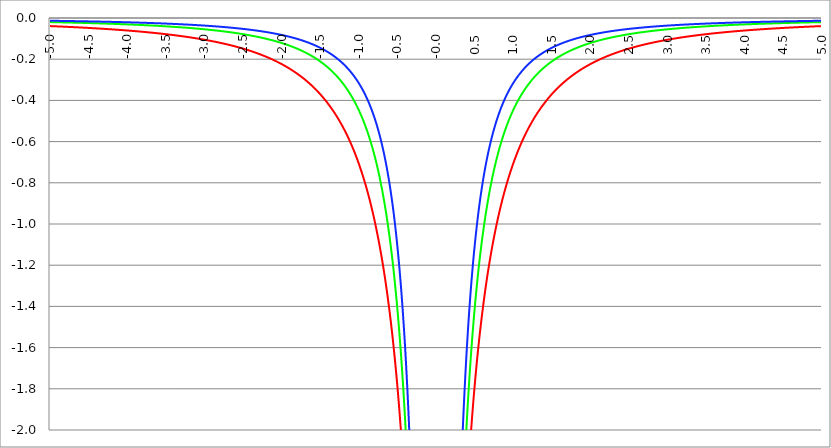
| Category | Series 1 | Series 0 | Series 2 |
|---|---|---|---|
| -5.0 | -0.039 | -0.02 | -0.013 |
| -4.995 | -0.039 | -0.02 | -0.013 |
| -4.99 | -0.039 | -0.02 | -0.013 |
| -4.985 | -0.039 | -0.02 | -0.013 |
| -4.98 | -0.04 | -0.02 | -0.013 |
| -4.975 | -0.04 | -0.02 | -0.013 |
| -4.97 | -0.04 | -0.02 | -0.013 |
| -4.965000000000001 | -0.04 | -0.02 | -0.013 |
| -4.960000000000001 | -0.04 | -0.02 | -0.014 |
| -4.955000000000001 | -0.04 | -0.02 | -0.014 |
| -4.950000000000001 | -0.04 | -0.02 | -0.014 |
| -4.945000000000001 | -0.04 | -0.02 | -0.014 |
| -4.940000000000001 | -0.04 | -0.02 | -0.014 |
| -4.935000000000001 | -0.04 | -0.02 | -0.014 |
| -4.930000000000001 | -0.04 | -0.02 | -0.014 |
| -4.925000000000002 | -0.04 | -0.021 | -0.014 |
| -4.920000000000002 | -0.04 | -0.021 | -0.014 |
| -4.915000000000002 | -0.041 | -0.021 | -0.014 |
| -4.910000000000002 | -0.041 | -0.021 | -0.014 |
| -4.905000000000002 | -0.041 | -0.021 | -0.014 |
| -4.900000000000002 | -0.041 | -0.021 | -0.014 |
| -4.895000000000002 | -0.041 | -0.021 | -0.014 |
| -4.890000000000002 | -0.041 | -0.021 | -0.014 |
| -4.885000000000002 | -0.041 | -0.021 | -0.014 |
| -4.880000000000002 | -0.041 | -0.021 | -0.014 |
| -4.875000000000003 | -0.041 | -0.021 | -0.014 |
| -4.870000000000003 | -0.041 | -0.021 | -0.014 |
| -4.865000000000003 | -0.041 | -0.021 | -0.014 |
| -4.860000000000003 | -0.041 | -0.021 | -0.014 |
| -4.855000000000003 | -0.042 | -0.021 | -0.014 |
| -4.850000000000003 | -0.042 | -0.021 | -0.014 |
| -4.845000000000003 | -0.042 | -0.021 | -0.014 |
| -4.840000000000003 | -0.042 | -0.021 | -0.014 |
| -4.835000000000003 | -0.042 | -0.021 | -0.014 |
| -4.830000000000004 | -0.042 | -0.021 | -0.014 |
| -4.825000000000004 | -0.042 | -0.021 | -0.014 |
| -4.820000000000004 | -0.042 | -0.021 | -0.014 |
| -4.815000000000004 | -0.042 | -0.021 | -0.014 |
| -4.810000000000004 | -0.042 | -0.021 | -0.014 |
| -4.805000000000004 | -0.042 | -0.022 | -0.014 |
| -4.800000000000004 | -0.042 | -0.022 | -0.014 |
| -4.795000000000004 | -0.043 | -0.022 | -0.014 |
| -4.790000000000004 | -0.043 | -0.022 | -0.014 |
| -4.785000000000004 | -0.043 | -0.022 | -0.015 |
| -4.780000000000004 | -0.043 | -0.022 | -0.015 |
| -4.775000000000004 | -0.043 | -0.022 | -0.015 |
| -4.770000000000004 | -0.043 | -0.022 | -0.015 |
| -4.765000000000005 | -0.043 | -0.022 | -0.015 |
| -4.760000000000005 | -0.043 | -0.022 | -0.015 |
| -4.755000000000005 | -0.043 | -0.022 | -0.015 |
| -4.750000000000005 | -0.043 | -0.022 | -0.015 |
| -4.745000000000005 | -0.043 | -0.022 | -0.015 |
| -4.740000000000005 | -0.044 | -0.022 | -0.015 |
| -4.735000000000005 | -0.044 | -0.022 | -0.015 |
| -4.730000000000005 | -0.044 | -0.022 | -0.015 |
| -4.725000000000006 | -0.044 | -0.022 | -0.015 |
| -4.720000000000006 | -0.044 | -0.022 | -0.015 |
| -4.715000000000006 | -0.044 | -0.022 | -0.015 |
| -4.710000000000006 | -0.044 | -0.022 | -0.015 |
| -4.705000000000006 | -0.044 | -0.022 | -0.015 |
| -4.700000000000006 | -0.044 | -0.023 | -0.015 |
| -4.695000000000006 | -0.044 | -0.023 | -0.015 |
| -4.690000000000006 | -0.044 | -0.023 | -0.015 |
| -4.685000000000007 | -0.045 | -0.023 | -0.015 |
| -4.680000000000007 | -0.045 | -0.023 | -0.015 |
| -4.675000000000007 | -0.045 | -0.023 | -0.015 |
| -4.670000000000007 | -0.045 | -0.023 | -0.015 |
| -4.665000000000007 | -0.045 | -0.023 | -0.015 |
| -4.660000000000007 | -0.045 | -0.023 | -0.015 |
| -4.655000000000007 | -0.045 | -0.023 | -0.015 |
| -4.650000000000007 | -0.045 | -0.023 | -0.015 |
| -4.645000000000007 | -0.045 | -0.023 | -0.015 |
| -4.640000000000008 | -0.045 | -0.023 | -0.015 |
| -4.635000000000008 | -0.046 | -0.023 | -0.015 |
| -4.630000000000008 | -0.046 | -0.023 | -0.016 |
| -4.625000000000008 | -0.046 | -0.023 | -0.016 |
| -4.620000000000008 | -0.046 | -0.023 | -0.016 |
| -4.615000000000008 | -0.046 | -0.023 | -0.016 |
| -4.610000000000008 | -0.046 | -0.023 | -0.016 |
| -4.605000000000008 | -0.046 | -0.023 | -0.016 |
| -4.600000000000008 | -0.046 | -0.023 | -0.016 |
| -4.595000000000009 | -0.046 | -0.024 | -0.016 |
| -4.590000000000009 | -0.046 | -0.024 | -0.016 |
| -4.585000000000009 | -0.046 | -0.024 | -0.016 |
| -4.580000000000009 | -0.047 | -0.024 | -0.016 |
| -4.57500000000001 | -0.047 | -0.024 | -0.016 |
| -4.57000000000001 | -0.047 | -0.024 | -0.016 |
| -4.565000000000009 | -0.047 | -0.024 | -0.016 |
| -4.560000000000009 | -0.047 | -0.024 | -0.016 |
| -4.555000000000009 | -0.047 | -0.024 | -0.016 |
| -4.55000000000001 | -0.047 | -0.024 | -0.016 |
| -4.54500000000001 | -0.047 | -0.024 | -0.016 |
| -4.54000000000001 | -0.047 | -0.024 | -0.016 |
| -4.53500000000001 | -0.047 | -0.024 | -0.016 |
| -4.53000000000001 | -0.048 | -0.024 | -0.016 |
| -4.52500000000001 | -0.048 | -0.024 | -0.016 |
| -4.52000000000001 | -0.048 | -0.024 | -0.016 |
| -4.51500000000001 | -0.048 | -0.024 | -0.016 |
| -4.51000000000001 | -0.048 | -0.024 | -0.016 |
| -4.505000000000011 | -0.048 | -0.024 | -0.016 |
| -4.500000000000011 | -0.048 | -0.025 | -0.016 |
| -4.495000000000011 | -0.048 | -0.025 | -0.016 |
| -4.490000000000011 | -0.048 | -0.025 | -0.016 |
| -4.485000000000011 | -0.049 | -0.025 | -0.017 |
| -4.480000000000011 | -0.049 | -0.025 | -0.017 |
| -4.475000000000011 | -0.049 | -0.025 | -0.017 |
| -4.470000000000011 | -0.049 | -0.025 | -0.017 |
| -4.465000000000011 | -0.049 | -0.025 | -0.017 |
| -4.460000000000011 | -0.049 | -0.025 | -0.017 |
| -4.455000000000012 | -0.049 | -0.025 | -0.017 |
| -4.450000000000012 | -0.049 | -0.025 | -0.017 |
| -4.445000000000012 | -0.049 | -0.025 | -0.017 |
| -4.440000000000012 | -0.049 | -0.025 | -0.017 |
| -4.435000000000012 | -0.05 | -0.025 | -0.017 |
| -4.430000000000012 | -0.05 | -0.025 | -0.017 |
| -4.425000000000012 | -0.05 | -0.025 | -0.017 |
| -4.420000000000012 | -0.05 | -0.025 | -0.017 |
| -4.415000000000012 | -0.05 | -0.025 | -0.017 |
| -4.410000000000013 | -0.05 | -0.026 | -0.017 |
| -4.405000000000013 | -0.05 | -0.026 | -0.017 |
| -4.400000000000013 | -0.05 | -0.026 | -0.017 |
| -4.395000000000013 | -0.05 | -0.026 | -0.017 |
| -4.390000000000013 | -0.051 | -0.026 | -0.017 |
| -4.385000000000013 | -0.051 | -0.026 | -0.017 |
| -4.380000000000013 | -0.051 | -0.026 | -0.017 |
| -4.375000000000013 | -0.051 | -0.026 | -0.017 |
| -4.370000000000013 | -0.051 | -0.026 | -0.017 |
| -4.365000000000013 | -0.051 | -0.026 | -0.017 |
| -4.360000000000014 | -0.051 | -0.026 | -0.017 |
| -4.355000000000014 | -0.051 | -0.026 | -0.018 |
| -4.350000000000014 | -0.052 | -0.026 | -0.018 |
| -4.345000000000014 | -0.052 | -0.026 | -0.018 |
| -4.340000000000014 | -0.052 | -0.026 | -0.018 |
| -4.335000000000014 | -0.052 | -0.026 | -0.018 |
| -4.330000000000014 | -0.052 | -0.026 | -0.018 |
| -4.325000000000014 | -0.052 | -0.027 | -0.018 |
| -4.320000000000014 | -0.052 | -0.027 | -0.018 |
| -4.315000000000015 | -0.052 | -0.027 | -0.018 |
| -4.310000000000015 | -0.052 | -0.027 | -0.018 |
| -4.305000000000015 | -0.053 | -0.027 | -0.018 |
| -4.300000000000015 | -0.053 | -0.027 | -0.018 |
| -4.295000000000015 | -0.053 | -0.027 | -0.018 |
| -4.290000000000015 | -0.053 | -0.027 | -0.018 |
| -4.285000000000015 | -0.053 | -0.027 | -0.018 |
| -4.280000000000015 | -0.053 | -0.027 | -0.018 |
| -4.275000000000015 | -0.053 | -0.027 | -0.018 |
| -4.270000000000015 | -0.053 | -0.027 | -0.018 |
| -4.265000000000016 | -0.054 | -0.027 | -0.018 |
| -4.260000000000016 | -0.054 | -0.027 | -0.018 |
| -4.255000000000016 | -0.054 | -0.027 | -0.018 |
| -4.250000000000016 | -0.054 | -0.027 | -0.018 |
| -4.245000000000016 | -0.054 | -0.028 | -0.018 |
| -4.240000000000016 | -0.054 | -0.028 | -0.018 |
| -4.235000000000016 | -0.054 | -0.028 | -0.019 |
| -4.230000000000016 | -0.054 | -0.028 | -0.019 |
| -4.225000000000017 | -0.055 | -0.028 | -0.019 |
| -4.220000000000017 | -0.055 | -0.028 | -0.019 |
| -4.215000000000017 | -0.055 | -0.028 | -0.019 |
| -4.210000000000017 | -0.055 | -0.028 | -0.019 |
| -4.205000000000017 | -0.055 | -0.028 | -0.019 |
| -4.200000000000017 | -0.055 | -0.028 | -0.019 |
| -4.195000000000017 | -0.055 | -0.028 | -0.019 |
| -4.190000000000017 | -0.055 | -0.028 | -0.019 |
| -4.185000000000017 | -0.056 | -0.028 | -0.019 |
| -4.180000000000017 | -0.056 | -0.028 | -0.019 |
| -4.175000000000018 | -0.056 | -0.028 | -0.019 |
| -4.170000000000018 | -0.056 | -0.029 | -0.019 |
| -4.165000000000018 | -0.056 | -0.029 | -0.019 |
| -4.160000000000018 | -0.056 | -0.029 | -0.019 |
| -4.155000000000018 | -0.056 | -0.029 | -0.019 |
| -4.150000000000018 | -0.056 | -0.029 | -0.019 |
| -4.145000000000018 | -0.057 | -0.029 | -0.019 |
| -4.140000000000018 | -0.057 | -0.029 | -0.019 |
| -4.135000000000018 | -0.057 | -0.029 | -0.019 |
| -4.130000000000019 | -0.057 | -0.029 | -0.019 |
| -4.125000000000019 | -0.057 | -0.029 | -0.02 |
| -4.120000000000019 | -0.057 | -0.029 | -0.02 |
| -4.115000000000019 | -0.057 | -0.029 | -0.02 |
| -4.110000000000019 | -0.058 | -0.029 | -0.02 |
| -4.105000000000019 | -0.058 | -0.029 | -0.02 |
| -4.100000000000019 | -0.058 | -0.03 | -0.02 |
| -4.095000000000019 | -0.058 | -0.03 | -0.02 |
| -4.090000000000019 | -0.058 | -0.03 | -0.02 |
| -4.085000000000019 | -0.058 | -0.03 | -0.02 |
| -4.08000000000002 | -0.058 | -0.03 | -0.02 |
| -4.07500000000002 | -0.058 | -0.03 | -0.02 |
| -4.07000000000002 | -0.059 | -0.03 | -0.02 |
| -4.06500000000002 | -0.059 | -0.03 | -0.02 |
| -4.06000000000002 | -0.059 | -0.03 | -0.02 |
| -4.05500000000002 | -0.059 | -0.03 | -0.02 |
| -4.05000000000002 | -0.059 | -0.03 | -0.02 |
| -4.04500000000002 | -0.059 | -0.03 | -0.02 |
| -4.04000000000002 | -0.059 | -0.03 | -0.02 |
| -4.03500000000002 | -0.06 | -0.03 | -0.02 |
| -4.03000000000002 | -0.06 | -0.031 | -0.02 |
| -4.025000000000021 | -0.06 | -0.031 | -0.021 |
| -4.020000000000021 | -0.06 | -0.031 | -0.021 |
| -4.015000000000021 | -0.06 | -0.031 | -0.021 |
| -4.010000000000021 | -0.06 | -0.031 | -0.021 |
| -4.005000000000021 | -0.06 | -0.031 | -0.021 |
| -4.000000000000021 | -0.061 | -0.031 | -0.021 |
| -3.995000000000021 | -0.061 | -0.031 | -0.021 |
| -3.990000000000021 | -0.061 | -0.031 | -0.021 |
| -3.985000000000022 | -0.061 | -0.031 | -0.021 |
| -3.980000000000022 | -0.061 | -0.031 | -0.021 |
| -3.975000000000022 | -0.061 | -0.031 | -0.021 |
| -3.970000000000022 | -0.062 | -0.031 | -0.021 |
| -3.965000000000022 | -0.062 | -0.032 | -0.021 |
| -3.960000000000022 | -0.062 | -0.032 | -0.021 |
| -3.955000000000022 | -0.062 | -0.032 | -0.021 |
| -3.950000000000022 | -0.062 | -0.032 | -0.021 |
| -3.945000000000022 | -0.062 | -0.032 | -0.021 |
| -3.940000000000023 | -0.062 | -0.032 | -0.021 |
| -3.935000000000023 | -0.063 | -0.032 | -0.021 |
| -3.930000000000023 | -0.063 | -0.032 | -0.022 |
| -3.925000000000023 | -0.063 | -0.032 | -0.022 |
| -3.920000000000023 | -0.063 | -0.032 | -0.022 |
| -3.915000000000023 | -0.063 | -0.032 | -0.022 |
| -3.910000000000023 | -0.063 | -0.032 | -0.022 |
| -3.905000000000023 | -0.064 | -0.033 | -0.022 |
| -3.900000000000023 | -0.064 | -0.033 | -0.022 |
| -3.895000000000023 | -0.064 | -0.033 | -0.022 |
| -3.890000000000024 | -0.064 | -0.033 | -0.022 |
| -3.885000000000024 | -0.064 | -0.033 | -0.022 |
| -3.880000000000024 | -0.064 | -0.033 | -0.022 |
| -3.875000000000024 | -0.064 | -0.033 | -0.022 |
| -3.870000000000024 | -0.065 | -0.033 | -0.022 |
| -3.865000000000024 | -0.065 | -0.033 | -0.022 |
| -3.860000000000024 | -0.065 | -0.033 | -0.022 |
| -3.855000000000024 | -0.065 | -0.033 | -0.022 |
| -3.850000000000024 | -0.065 | -0.033 | -0.022 |
| -3.845000000000025 | -0.065 | -0.034 | -0.022 |
| -3.840000000000025 | -0.066 | -0.034 | -0.023 |
| -3.835000000000025 | -0.066 | -0.034 | -0.023 |
| -3.830000000000025 | -0.066 | -0.034 | -0.023 |
| -3.825000000000025 | -0.066 | -0.034 | -0.023 |
| -3.820000000000025 | -0.066 | -0.034 | -0.023 |
| -3.815000000000025 | -0.066 | -0.034 | -0.023 |
| -3.810000000000025 | -0.067 | -0.034 | -0.023 |
| -3.805000000000025 | -0.067 | -0.034 | -0.023 |
| -3.800000000000026 | -0.067 | -0.034 | -0.023 |
| -3.795000000000026 | -0.067 | -0.034 | -0.023 |
| -3.790000000000026 | -0.067 | -0.035 | -0.023 |
| -3.785000000000026 | -0.067 | -0.035 | -0.023 |
| -3.780000000000026 | -0.068 | -0.035 | -0.023 |
| -3.775000000000026 | -0.068 | -0.035 | -0.023 |
| -3.770000000000026 | -0.068 | -0.035 | -0.023 |
| -3.765000000000026 | -0.068 | -0.035 | -0.023 |
| -3.760000000000026 | -0.068 | -0.035 | -0.023 |
| -3.755000000000026 | -0.069 | -0.035 | -0.024 |
| -3.750000000000027 | -0.069 | -0.035 | -0.024 |
| -3.745000000000027 | -0.069 | -0.035 | -0.024 |
| -3.740000000000027 | -0.069 | -0.035 | -0.024 |
| -3.735000000000027 | -0.069 | -0.036 | -0.024 |
| -3.730000000000027 | -0.069 | -0.036 | -0.024 |
| -3.725000000000027 | -0.07 | -0.036 | -0.024 |
| -3.720000000000027 | -0.07 | -0.036 | -0.024 |
| -3.715000000000027 | -0.07 | -0.036 | -0.024 |
| -3.710000000000027 | -0.07 | -0.036 | -0.024 |
| -3.705000000000028 | -0.07 | -0.036 | -0.024 |
| -3.700000000000028 | -0.071 | -0.036 | -0.024 |
| -3.695000000000028 | -0.071 | -0.036 | -0.024 |
| -3.690000000000028 | -0.071 | -0.036 | -0.024 |
| -3.685000000000028 | -0.071 | -0.036 | -0.024 |
| -3.680000000000028 | -0.071 | -0.037 | -0.025 |
| -3.675000000000028 | -0.071 | -0.037 | -0.025 |
| -3.670000000000028 | -0.072 | -0.037 | -0.025 |
| -3.665000000000028 | -0.072 | -0.037 | -0.025 |
| -3.660000000000028 | -0.072 | -0.037 | -0.025 |
| -3.655000000000029 | -0.072 | -0.037 | -0.025 |
| -3.650000000000029 | -0.072 | -0.037 | -0.025 |
| -3.645000000000029 | -0.073 | -0.037 | -0.025 |
| -3.640000000000029 | -0.073 | -0.037 | -0.025 |
| -3.635000000000029 | -0.073 | -0.037 | -0.025 |
| -3.630000000000029 | -0.073 | -0.038 | -0.025 |
| -3.625000000000029 | -0.073 | -0.038 | -0.025 |
| -3.620000000000029 | -0.074 | -0.038 | -0.025 |
| -3.615000000000029 | -0.074 | -0.038 | -0.025 |
| -3.61000000000003 | -0.074 | -0.038 | -0.025 |
| -3.60500000000003 | -0.074 | -0.038 | -0.026 |
| -3.60000000000003 | -0.074 | -0.038 | -0.026 |
| -3.59500000000003 | -0.075 | -0.038 | -0.026 |
| -3.59000000000003 | -0.075 | -0.038 | -0.026 |
| -3.58500000000003 | -0.075 | -0.039 | -0.026 |
| -3.58000000000003 | -0.075 | -0.039 | -0.026 |
| -3.57500000000003 | -0.075 | -0.039 | -0.026 |
| -3.57000000000003 | -0.076 | -0.039 | -0.026 |
| -3.565000000000031 | -0.076 | -0.039 | -0.026 |
| -3.560000000000031 | -0.076 | -0.039 | -0.026 |
| -3.555000000000031 | -0.076 | -0.039 | -0.026 |
| -3.550000000000031 | -0.076 | -0.039 | -0.026 |
| -3.545000000000031 | -0.077 | -0.039 | -0.026 |
| -3.540000000000031 | -0.077 | -0.04 | -0.026 |
| -3.535000000000031 | -0.077 | -0.04 | -0.027 |
| -3.530000000000031 | -0.077 | -0.04 | -0.027 |
| -3.525000000000031 | -0.077 | -0.04 | -0.027 |
| -3.520000000000032 | -0.078 | -0.04 | -0.027 |
| -3.515000000000032 | -0.078 | -0.04 | -0.027 |
| -3.510000000000032 | -0.078 | -0.04 | -0.027 |
| -3.505000000000032 | -0.078 | -0.04 | -0.027 |
| -3.500000000000032 | -0.078 | -0.04 | -0.027 |
| -3.495000000000032 | -0.079 | -0.041 | -0.027 |
| -3.490000000000032 | -0.079 | -0.041 | -0.027 |
| -3.485000000000032 | -0.079 | -0.041 | -0.027 |
| -3.480000000000032 | -0.079 | -0.041 | -0.027 |
| -3.475000000000032 | -0.08 | -0.041 | -0.027 |
| -3.470000000000033 | -0.08 | -0.041 | -0.028 |
| -3.465000000000033 | -0.08 | -0.041 | -0.028 |
| -3.460000000000033 | -0.08 | -0.041 | -0.028 |
| -3.455000000000033 | -0.08 | -0.041 | -0.028 |
| -3.450000000000033 | -0.081 | -0.042 | -0.028 |
| -3.445000000000033 | -0.081 | -0.042 | -0.028 |
| -3.440000000000033 | -0.081 | -0.042 | -0.028 |
| -3.435000000000033 | -0.081 | -0.042 | -0.028 |
| -3.430000000000033 | -0.082 | -0.042 | -0.028 |
| -3.425000000000034 | -0.082 | -0.042 | -0.028 |
| -3.420000000000034 | -0.082 | -0.042 | -0.028 |
| -3.415000000000034 | -0.082 | -0.042 | -0.028 |
| -3.410000000000034 | -0.083 | -0.043 | -0.029 |
| -3.405000000000034 | -0.083 | -0.043 | -0.029 |
| -3.400000000000034 | -0.083 | -0.043 | -0.029 |
| -3.395000000000034 | -0.083 | -0.043 | -0.029 |
| -3.390000000000034 | -0.083 | -0.043 | -0.029 |
| -3.385000000000034 | -0.084 | -0.043 | -0.029 |
| -3.380000000000034 | -0.084 | -0.043 | -0.029 |
| -3.375000000000035 | -0.084 | -0.043 | -0.029 |
| -3.370000000000035 | -0.084 | -0.044 | -0.029 |
| -3.365000000000035 | -0.085 | -0.044 | -0.029 |
| -3.360000000000035 | -0.085 | -0.044 | -0.029 |
| -3.355000000000035 | -0.085 | -0.044 | -0.029 |
| -3.350000000000035 | -0.085 | -0.044 | -0.03 |
| -3.345000000000035 | -0.086 | -0.044 | -0.03 |
| -3.340000000000035 | -0.086 | -0.044 | -0.03 |
| -3.335000000000035 | -0.086 | -0.044 | -0.03 |
| -3.330000000000036 | -0.086 | -0.045 | -0.03 |
| -3.325000000000036 | -0.087 | -0.045 | -0.03 |
| -3.320000000000036 | -0.087 | -0.045 | -0.03 |
| -3.315000000000036 | -0.087 | -0.045 | -0.03 |
| -3.310000000000036 | -0.087 | -0.045 | -0.03 |
| -3.305000000000036 | -0.088 | -0.045 | -0.03 |
| -3.300000000000036 | -0.088 | -0.045 | -0.03 |
| -3.295000000000036 | -0.088 | -0.046 | -0.031 |
| -3.290000000000036 | -0.088 | -0.046 | -0.031 |
| -3.285000000000036 | -0.089 | -0.046 | -0.031 |
| -3.280000000000036 | -0.089 | -0.046 | -0.031 |
| -3.275000000000037 | -0.089 | -0.046 | -0.031 |
| -3.270000000000037 | -0.089 | -0.046 | -0.031 |
| -3.265000000000037 | -0.09 | -0.046 | -0.031 |
| -3.260000000000037 | -0.09 | -0.047 | -0.031 |
| -3.255000000000037 | -0.09 | -0.047 | -0.031 |
| -3.250000000000037 | -0.09 | -0.047 | -0.031 |
| -3.245000000000037 | -0.091 | -0.047 | -0.031 |
| -3.240000000000037 | -0.091 | -0.047 | -0.032 |
| -3.235000000000038 | -0.091 | -0.047 | -0.032 |
| -3.230000000000038 | -0.092 | -0.047 | -0.032 |
| -3.225000000000038 | -0.092 | -0.048 | -0.032 |
| -3.220000000000038 | -0.092 | -0.048 | -0.032 |
| -3.215000000000038 | -0.092 | -0.048 | -0.032 |
| -3.210000000000038 | -0.093 | -0.048 | -0.032 |
| -3.205000000000038 | -0.093 | -0.048 | -0.032 |
| -3.200000000000038 | -0.093 | -0.048 | -0.032 |
| -3.195000000000038 | -0.093 | -0.048 | -0.032 |
| -3.190000000000039 | -0.094 | -0.049 | -0.033 |
| -3.185000000000039 | -0.094 | -0.049 | -0.033 |
| -3.180000000000039 | -0.094 | -0.049 | -0.033 |
| -3.175000000000039 | -0.095 | -0.049 | -0.033 |
| -3.170000000000039 | -0.095 | -0.049 | -0.033 |
| -3.16500000000004 | -0.095 | -0.049 | -0.033 |
| -3.16000000000004 | -0.095 | -0.049 | -0.033 |
| -3.155000000000039 | -0.096 | -0.05 | -0.033 |
| -3.150000000000039 | -0.096 | -0.05 | -0.033 |
| -3.14500000000004 | -0.096 | -0.05 | -0.034 |
| -3.14000000000004 | -0.097 | -0.05 | -0.034 |
| -3.13500000000004 | -0.097 | -0.05 | -0.034 |
| -3.13000000000004 | -0.097 | -0.05 | -0.034 |
| -3.12500000000004 | -0.098 | -0.051 | -0.034 |
| -3.12000000000004 | -0.098 | -0.051 | -0.034 |
| -3.11500000000004 | -0.098 | -0.051 | -0.034 |
| -3.11000000000004 | -0.098 | -0.051 | -0.034 |
| -3.10500000000004 | -0.099 | -0.051 | -0.034 |
| -3.10000000000004 | -0.099 | -0.051 | -0.034 |
| -3.095000000000041 | -0.099 | -0.052 | -0.035 |
| -3.090000000000041 | -0.1 | -0.052 | -0.035 |
| -3.085000000000041 | -0.1 | -0.052 | -0.035 |
| -3.080000000000041 | -0.1 | -0.052 | -0.035 |
| -3.075000000000041 | -0.101 | -0.052 | -0.035 |
| -3.070000000000041 | -0.101 | -0.052 | -0.035 |
| -3.065000000000041 | -0.101 | -0.053 | -0.035 |
| -3.060000000000041 | -0.102 | -0.053 | -0.035 |
| -3.055000000000041 | -0.102 | -0.053 | -0.036 |
| -3.050000000000042 | -0.102 | -0.053 | -0.036 |
| -3.045000000000042 | -0.102 | -0.053 | -0.036 |
| -3.040000000000042 | -0.103 | -0.053 | -0.036 |
| -3.035000000000042 | -0.103 | -0.054 | -0.036 |
| -3.030000000000042 | -0.103 | -0.054 | -0.036 |
| -3.025000000000042 | -0.104 | -0.054 | -0.036 |
| -3.020000000000042 | -0.104 | -0.054 | -0.036 |
| -3.015000000000042 | -0.104 | -0.054 | -0.036 |
| -3.010000000000042 | -0.105 | -0.054 | -0.037 |
| -3.005000000000043 | -0.105 | -0.055 | -0.037 |
| -3.000000000000043 | -0.105 | -0.055 | -0.037 |
| -2.995000000000043 | -0.106 | -0.055 | -0.037 |
| -2.990000000000043 | -0.106 | -0.055 | -0.037 |
| -2.985000000000043 | -0.106 | -0.055 | -0.037 |
| -2.980000000000043 | -0.107 | -0.056 | -0.037 |
| -2.975000000000043 | -0.107 | -0.056 | -0.037 |
| -2.970000000000043 | -0.107 | -0.056 | -0.038 |
| -2.965000000000043 | -0.108 | -0.056 | -0.038 |
| -2.960000000000043 | -0.108 | -0.056 | -0.038 |
| -2.955000000000044 | -0.108 | -0.056 | -0.038 |
| -2.950000000000044 | -0.109 | -0.057 | -0.038 |
| -2.945000000000044 | -0.109 | -0.057 | -0.038 |
| -2.940000000000044 | -0.11 | -0.057 | -0.038 |
| -2.935000000000044 | -0.11 | -0.057 | -0.038 |
| -2.930000000000044 | -0.11 | -0.057 | -0.039 |
| -2.925000000000044 | -0.111 | -0.058 | -0.039 |
| -2.920000000000044 | -0.111 | -0.058 | -0.039 |
| -2.915000000000044 | -0.111 | -0.058 | -0.039 |
| -2.910000000000045 | -0.112 | -0.058 | -0.039 |
| -2.905000000000045 | -0.112 | -0.058 | -0.039 |
| -2.900000000000045 | -0.112 | -0.059 | -0.039 |
| -2.895000000000045 | -0.113 | -0.059 | -0.04 |
| -2.890000000000045 | -0.113 | -0.059 | -0.04 |
| -2.885000000000045 | -0.114 | -0.059 | -0.04 |
| -2.880000000000045 | -0.114 | -0.059 | -0.04 |
| -2.875000000000045 | -0.114 | -0.06 | -0.04 |
| -2.870000000000045 | -0.115 | -0.06 | -0.04 |
| -2.865000000000045 | -0.115 | -0.06 | -0.04 |
| -2.860000000000046 | -0.115 | -0.06 | -0.04 |
| -2.855000000000046 | -0.116 | -0.06 | -0.041 |
| -2.850000000000046 | -0.116 | -0.061 | -0.041 |
| -2.845000000000046 | -0.117 | -0.061 | -0.041 |
| -2.840000000000046 | -0.117 | -0.061 | -0.041 |
| -2.835000000000046 | -0.117 | -0.061 | -0.041 |
| -2.830000000000046 | -0.118 | -0.061 | -0.041 |
| -2.825000000000046 | -0.118 | -0.062 | -0.041 |
| -2.820000000000046 | -0.119 | -0.062 | -0.042 |
| -2.815000000000047 | -0.119 | -0.062 | -0.042 |
| -2.810000000000047 | -0.119 | -0.062 | -0.042 |
| -2.805000000000047 | -0.12 | -0.063 | -0.042 |
| -2.800000000000047 | -0.12 | -0.063 | -0.042 |
| -2.795000000000047 | -0.121 | -0.063 | -0.042 |
| -2.790000000000047 | -0.121 | -0.063 | -0.043 |
| -2.785000000000047 | -0.121 | -0.063 | -0.043 |
| -2.780000000000047 | -0.122 | -0.064 | -0.043 |
| -2.775000000000047 | -0.122 | -0.064 | -0.043 |
| -2.770000000000047 | -0.123 | -0.064 | -0.043 |
| -2.765000000000048 | -0.123 | -0.064 | -0.043 |
| -2.760000000000048 | -0.123 | -0.065 | -0.043 |
| -2.755000000000048 | -0.124 | -0.065 | -0.044 |
| -2.750000000000048 | -0.124 | -0.065 | -0.044 |
| -2.745000000000048 | -0.125 | -0.065 | -0.044 |
| -2.740000000000048 | -0.125 | -0.066 | -0.044 |
| -2.735000000000048 | -0.126 | -0.066 | -0.044 |
| -2.730000000000048 | -0.126 | -0.066 | -0.044 |
| -2.725000000000048 | -0.126 | -0.066 | -0.045 |
| -2.720000000000049 | -0.127 | -0.066 | -0.045 |
| -2.715000000000049 | -0.127 | -0.067 | -0.045 |
| -2.710000000000049 | -0.128 | -0.067 | -0.045 |
| -2.705000000000049 | -0.128 | -0.067 | -0.045 |
| -2.700000000000049 | -0.129 | -0.067 | -0.045 |
| -2.695000000000049 | -0.129 | -0.068 | -0.046 |
| -2.690000000000049 | -0.13 | -0.068 | -0.046 |
| -2.685000000000049 | -0.13 | -0.068 | -0.046 |
| -2.680000000000049 | -0.13 | -0.068 | -0.046 |
| -2.675000000000049 | -0.131 | -0.069 | -0.046 |
| -2.67000000000005 | -0.131 | -0.069 | -0.046 |
| -2.66500000000005 | -0.132 | -0.069 | -0.047 |
| -2.66000000000005 | -0.132 | -0.069 | -0.047 |
| -2.65500000000005 | -0.133 | -0.07 | -0.047 |
| -2.65000000000005 | -0.133 | -0.07 | -0.047 |
| -2.64500000000005 | -0.134 | -0.07 | -0.047 |
| -2.64000000000005 | -0.134 | -0.07 | -0.047 |
| -2.63500000000005 | -0.135 | -0.071 | -0.048 |
| -2.63000000000005 | -0.135 | -0.071 | -0.048 |
| -2.625000000000051 | -0.136 | -0.071 | -0.048 |
| -2.620000000000051 | -0.136 | -0.072 | -0.048 |
| -2.615000000000051 | -0.137 | -0.072 | -0.048 |
| -2.610000000000051 | -0.137 | -0.072 | -0.049 |
| -2.605000000000051 | -0.138 | -0.072 | -0.049 |
| -2.600000000000051 | -0.138 | -0.073 | -0.049 |
| -2.595000000000051 | -0.139 | -0.073 | -0.049 |
| -2.590000000000051 | -0.139 | -0.073 | -0.049 |
| -2.585000000000051 | -0.14 | -0.073 | -0.049 |
| -2.580000000000052 | -0.14 | -0.074 | -0.05 |
| -2.575000000000052 | -0.141 | -0.074 | -0.05 |
| -2.570000000000052 | -0.141 | -0.074 | -0.05 |
| -2.565000000000052 | -0.142 | -0.075 | -0.05 |
| -2.560000000000052 | -0.142 | -0.075 | -0.05 |
| -2.555000000000052 | -0.143 | -0.075 | -0.051 |
| -2.550000000000052 | -0.143 | -0.075 | -0.051 |
| -2.545000000000052 | -0.144 | -0.076 | -0.051 |
| -2.540000000000052 | -0.144 | -0.076 | -0.051 |
| -2.535000000000053 | -0.145 | -0.076 | -0.051 |
| -2.530000000000053 | -0.145 | -0.077 | -0.052 |
| -2.525000000000053 | -0.146 | -0.077 | -0.052 |
| -2.520000000000053 | -0.146 | -0.077 | -0.052 |
| -2.515000000000053 | -0.147 | -0.078 | -0.052 |
| -2.510000000000053 | -0.147 | -0.078 | -0.052 |
| -2.505000000000053 | -0.148 | -0.078 | -0.053 |
| -2.500000000000053 | -0.149 | -0.078 | -0.053 |
| -2.495000000000053 | -0.149 | -0.079 | -0.053 |
| -2.490000000000053 | -0.15 | -0.079 | -0.053 |
| -2.485000000000054 | -0.15 | -0.079 | -0.053 |
| -2.480000000000054 | -0.151 | -0.08 | -0.054 |
| -2.475000000000054 | -0.151 | -0.08 | -0.054 |
| -2.470000000000054 | -0.152 | -0.08 | -0.054 |
| -2.465000000000054 | -0.153 | -0.081 | -0.054 |
| -2.460000000000054 | -0.153 | -0.081 | -0.055 |
| -2.455000000000054 | -0.154 | -0.081 | -0.055 |
| -2.450000000000054 | -0.154 | -0.082 | -0.055 |
| -2.445000000000054 | -0.155 | -0.082 | -0.055 |
| -2.440000000000055 | -0.155 | -0.082 | -0.055 |
| -2.435000000000055 | -0.156 | -0.083 | -0.056 |
| -2.430000000000055 | -0.157 | -0.083 | -0.056 |
| -2.425000000000055 | -0.157 | -0.083 | -0.056 |
| -2.420000000000055 | -0.158 | -0.084 | -0.056 |
| -2.415000000000055 | -0.158 | -0.084 | -0.057 |
| -2.410000000000055 | -0.159 | -0.084 | -0.057 |
| -2.405000000000055 | -0.16 | -0.085 | -0.057 |
| -2.400000000000055 | -0.16 | -0.085 | -0.057 |
| -2.395000000000055 | -0.161 | -0.085 | -0.058 |
| -2.390000000000056 | -0.162 | -0.086 | -0.058 |
| -2.385000000000056 | -0.162 | -0.086 | -0.058 |
| -2.380000000000056 | -0.163 | -0.086 | -0.058 |
| -2.375000000000056 | -0.163 | -0.087 | -0.059 |
| -2.370000000000056 | -0.164 | -0.087 | -0.059 |
| -2.365000000000056 | -0.165 | -0.087 | -0.059 |
| -2.360000000000056 | -0.165 | -0.088 | -0.059 |
| -2.355000000000056 | -0.166 | -0.088 | -0.06 |
| -2.350000000000056 | -0.167 | -0.089 | -0.06 |
| -2.345000000000057 | -0.167 | -0.089 | -0.06 |
| -2.340000000000057 | -0.168 | -0.089 | -0.06 |
| -2.335000000000057 | -0.169 | -0.09 | -0.061 |
| -2.330000000000057 | -0.169 | -0.09 | -0.061 |
| -2.325000000000057 | -0.17 | -0.09 | -0.061 |
| -2.320000000000057 | -0.171 | -0.091 | -0.061 |
| -2.315000000000057 | -0.171 | -0.091 | -0.062 |
| -2.310000000000057 | -0.172 | -0.092 | -0.062 |
| -2.305000000000057 | -0.173 | -0.092 | -0.062 |
| -2.300000000000058 | -0.173 | -0.092 | -0.062 |
| -2.295000000000058 | -0.174 | -0.093 | -0.063 |
| -2.290000000000058 | -0.175 | -0.093 | -0.063 |
| -2.285000000000058 | -0.175 | -0.094 | -0.063 |
| -2.280000000000058 | -0.176 | -0.094 | -0.063 |
| -2.275000000000058 | -0.177 | -0.094 | -0.064 |
| -2.270000000000058 | -0.178 | -0.095 | -0.064 |
| -2.265000000000058 | -0.178 | -0.095 | -0.064 |
| -2.260000000000058 | -0.179 | -0.096 | -0.065 |
| -2.255000000000058 | -0.18 | -0.096 | -0.065 |
| -2.250000000000059 | -0.181 | -0.096 | -0.065 |
| -2.245000000000059 | -0.181 | -0.097 | -0.065 |
| -2.240000000000059 | -0.182 | -0.097 | -0.066 |
| -2.235000000000059 | -0.183 | -0.098 | -0.066 |
| -2.23000000000006 | -0.183 | -0.098 | -0.066 |
| -2.22500000000006 | -0.184 | -0.099 | -0.067 |
| -2.22000000000006 | -0.185 | -0.099 | -0.067 |
| -2.215000000000059 | -0.186 | -0.099 | -0.067 |
| -2.210000000000059 | -0.187 | -0.1 | -0.067 |
| -2.20500000000006 | -0.187 | -0.1 | -0.068 |
| -2.20000000000006 | -0.188 | -0.101 | -0.068 |
| -2.19500000000006 | -0.189 | -0.101 | -0.068 |
| -2.19000000000006 | -0.19 | -0.102 | -0.069 |
| -2.18500000000006 | -0.19 | -0.102 | -0.069 |
| -2.18000000000006 | -0.191 | -0.103 | -0.069 |
| -2.17500000000006 | -0.192 | -0.103 | -0.07 |
| -2.17000000000006 | -0.193 | -0.103 | -0.07 |
| -2.16500000000006 | -0.194 | -0.104 | -0.07 |
| -2.160000000000061 | -0.195 | -0.104 | -0.071 |
| -2.155000000000061 | -0.195 | -0.105 | -0.071 |
| -2.150000000000061 | -0.196 | -0.105 | -0.071 |
| -2.145000000000061 | -0.197 | -0.106 | -0.072 |
| -2.140000000000061 | -0.198 | -0.106 | -0.072 |
| -2.135000000000061 | -0.199 | -0.107 | -0.072 |
| -2.130000000000061 | -0.2 | -0.107 | -0.073 |
| -2.125000000000061 | -0.2 | -0.108 | -0.073 |
| -2.120000000000061 | -0.201 | -0.108 | -0.073 |
| -2.115000000000061 | -0.202 | -0.109 | -0.074 |
| -2.110000000000062 | -0.203 | -0.109 | -0.074 |
| -2.105000000000062 | -0.204 | -0.11 | -0.074 |
| -2.100000000000062 | -0.205 | -0.11 | -0.075 |
| -2.095000000000062 | -0.206 | -0.111 | -0.075 |
| -2.090000000000062 | -0.207 | -0.111 | -0.075 |
| -2.085000000000062 | -0.207 | -0.112 | -0.076 |
| -2.080000000000062 | -0.208 | -0.112 | -0.076 |
| -2.075000000000062 | -0.209 | -0.113 | -0.076 |
| -2.070000000000062 | -0.21 | -0.113 | -0.077 |
| -2.065000000000063 | -0.211 | -0.114 | -0.077 |
| -2.060000000000063 | -0.212 | -0.115 | -0.078 |
| -2.055000000000063 | -0.213 | -0.115 | -0.078 |
| -2.050000000000063 | -0.214 | -0.116 | -0.078 |
| -2.045000000000063 | -0.215 | -0.116 | -0.079 |
| -2.040000000000063 | -0.216 | -0.117 | -0.079 |
| -2.035000000000063 | -0.217 | -0.117 | -0.079 |
| -2.030000000000063 | -0.218 | -0.118 | -0.08 |
| -2.025000000000063 | -0.219 | -0.118 | -0.08 |
| -2.020000000000064 | -0.22 | -0.119 | -0.081 |
| -2.015000000000064 | -0.221 | -0.12 | -0.081 |
| -2.010000000000064 | -0.222 | -0.12 | -0.081 |
| -2.005000000000064 | -0.223 | -0.121 | -0.082 |
| -2.000000000000064 | -0.224 | -0.121 | -0.082 |
| -1.995000000000064 | -0.225 | -0.122 | -0.083 |
| -1.990000000000064 | -0.226 | -0.122 | -0.083 |
| -1.985000000000064 | -0.227 | -0.123 | -0.083 |
| -1.980000000000064 | -0.228 | -0.124 | -0.084 |
| -1.975000000000064 | -0.229 | -0.124 | -0.084 |
| -1.970000000000065 | -0.23 | -0.125 | -0.085 |
| -1.965000000000065 | -0.231 | -0.125 | -0.085 |
| -1.960000000000065 | -0.232 | -0.126 | -0.086 |
| -1.955000000000065 | -0.233 | -0.127 | -0.086 |
| -1.950000000000065 | -0.234 | -0.127 | -0.086 |
| -1.945000000000065 | -0.235 | -0.128 | -0.087 |
| -1.940000000000065 | -0.236 | -0.129 | -0.087 |
| -1.935000000000065 | -0.237 | -0.129 | -0.088 |
| -1.930000000000065 | -0.238 | -0.13 | -0.088 |
| -1.925000000000066 | -0.239 | -0.131 | -0.089 |
| -1.920000000000066 | -0.241 | -0.131 | -0.089 |
| -1.915000000000066 | -0.242 | -0.132 | -0.09 |
| -1.910000000000066 | -0.243 | -0.133 | -0.09 |
| -1.905000000000066 | -0.244 | -0.133 | -0.09 |
| -1.900000000000066 | -0.245 | -0.134 | -0.091 |
| -1.895000000000066 | -0.246 | -0.135 | -0.091 |
| -1.890000000000066 | -0.247 | -0.135 | -0.092 |
| -1.885000000000066 | -0.249 | -0.136 | -0.092 |
| -1.880000000000066 | -0.25 | -0.137 | -0.093 |
| -1.875000000000067 | -0.251 | -0.137 | -0.093 |
| -1.870000000000067 | -0.252 | -0.138 | -0.094 |
| -1.865000000000067 | -0.253 | -0.139 | -0.094 |
| -1.860000000000067 | -0.255 | -0.14 | -0.095 |
| -1.855000000000067 | -0.256 | -0.14 | -0.095 |
| -1.850000000000067 | -0.257 | -0.141 | -0.096 |
| -1.845000000000067 | -0.258 | -0.142 | -0.096 |
| -1.840000000000067 | -0.26 | -0.143 | -0.097 |
| -1.835000000000067 | -0.261 | -0.143 | -0.097 |
| -1.830000000000068 | -0.262 | -0.144 | -0.098 |
| -1.825000000000068 | -0.263 | -0.145 | -0.098 |
| -1.820000000000068 | -0.265 | -0.146 | -0.099 |
| -1.815000000000068 | -0.266 | -0.146 | -0.1 |
| -1.810000000000068 | -0.267 | -0.147 | -0.1 |
| -1.805000000000068 | -0.268 | -0.148 | -0.101 |
| -1.800000000000068 | -0.27 | -0.149 | -0.101 |
| -1.795000000000068 | -0.271 | -0.149 | -0.102 |
| -1.790000000000068 | -0.272 | -0.15 | -0.102 |
| -1.785000000000068 | -0.274 | -0.151 | -0.103 |
| -1.780000000000069 | -0.275 | -0.152 | -0.103 |
| -1.775000000000069 | -0.277 | -0.153 | -0.104 |
| -1.770000000000069 | -0.278 | -0.154 | -0.105 |
| -1.765000000000069 | -0.279 | -0.154 | -0.105 |
| -1.760000000000069 | -0.281 | -0.155 | -0.106 |
| -1.75500000000007 | -0.282 | -0.156 | -0.106 |
| -1.75000000000007 | -0.284 | -0.157 | -0.107 |
| -1.745000000000069 | -0.285 | -0.158 | -0.108 |
| -1.740000000000069 | -0.286 | -0.159 | -0.108 |
| -1.73500000000007 | -0.288 | -0.16 | -0.109 |
| -1.73000000000007 | -0.289 | -0.16 | -0.109 |
| -1.72500000000007 | -0.291 | -0.161 | -0.11 |
| -1.72000000000007 | -0.292 | -0.162 | -0.111 |
| -1.71500000000007 | -0.294 | -0.163 | -0.111 |
| -1.71000000000007 | -0.295 | -0.164 | -0.112 |
| -1.70500000000007 | -0.297 | -0.165 | -0.113 |
| -1.70000000000007 | -0.298 | -0.166 | -0.113 |
| -1.69500000000007 | -0.3 | -0.167 | -0.114 |
| -1.69000000000007 | -0.301 | -0.168 | -0.115 |
| -1.685000000000071 | -0.303 | -0.169 | -0.115 |
| -1.680000000000071 | -0.304 | -0.17 | -0.116 |
| -1.675000000000071 | -0.306 | -0.171 | -0.117 |
| -1.670000000000071 | -0.308 | -0.172 | -0.117 |
| -1.665000000000071 | -0.309 | -0.173 | -0.118 |
| -1.660000000000071 | -0.311 | -0.174 | -0.119 |
| -1.655000000000071 | -0.312 | -0.175 | -0.119 |
| -1.650000000000071 | -0.314 | -0.176 | -0.12 |
| -1.645000000000071 | -0.316 | -0.177 | -0.121 |
| -1.640000000000072 | -0.317 | -0.178 | -0.121 |
| -1.635000000000072 | -0.319 | -0.179 | -0.122 |
| -1.630000000000072 | -0.321 | -0.18 | -0.123 |
| -1.625000000000072 | -0.323 | -0.181 | -0.124 |
| -1.620000000000072 | -0.324 | -0.182 | -0.124 |
| -1.615000000000072 | -0.326 | -0.183 | -0.125 |
| -1.610000000000072 | -0.328 | -0.184 | -0.126 |
| -1.605000000000072 | -0.329 | -0.185 | -0.127 |
| -1.600000000000072 | -0.331 | -0.186 | -0.127 |
| -1.595000000000073 | -0.333 | -0.188 | -0.128 |
| -1.590000000000073 | -0.335 | -0.189 | -0.129 |
| -1.585000000000073 | -0.337 | -0.19 | -0.13 |
| -1.580000000000073 | -0.338 | -0.191 | -0.131 |
| -1.575000000000073 | -0.34 | -0.192 | -0.131 |
| -1.570000000000073 | -0.342 | -0.193 | -0.132 |
| -1.565000000000073 | -0.344 | -0.194 | -0.133 |
| -1.560000000000073 | -0.346 | -0.196 | -0.134 |
| -1.555000000000073 | -0.348 | -0.197 | -0.135 |
| -1.550000000000074 | -0.35 | -0.198 | -0.136 |
| -1.545000000000074 | -0.352 | -0.199 | -0.137 |
| -1.540000000000074 | -0.354 | -0.201 | -0.137 |
| -1.535000000000074 | -0.356 | -0.202 | -0.138 |
| -1.530000000000074 | -0.358 | -0.203 | -0.139 |
| -1.525000000000074 | -0.36 | -0.204 | -0.14 |
| -1.520000000000074 | -0.362 | -0.206 | -0.141 |
| -1.515000000000074 | -0.364 | -0.207 | -0.142 |
| -1.510000000000074 | -0.366 | -0.208 | -0.143 |
| -1.505000000000074 | -0.368 | -0.209 | -0.144 |
| -1.500000000000075 | -0.37 | -0.211 | -0.145 |
| -1.495000000000075 | -0.372 | -0.212 | -0.146 |
| -1.490000000000075 | -0.374 | -0.214 | -0.147 |
| -1.485000000000075 | -0.376 | -0.215 | -0.147 |
| -1.480000000000075 | -0.378 | -0.216 | -0.148 |
| -1.475000000000075 | -0.38 | -0.218 | -0.149 |
| -1.470000000000075 | -0.383 | -0.219 | -0.15 |
| -1.465000000000075 | -0.385 | -0.22 | -0.151 |
| -1.460000000000075 | -0.387 | -0.222 | -0.152 |
| -1.455000000000076 | -0.389 | -0.223 | -0.153 |
| -1.450000000000076 | -0.392 | -0.225 | -0.155 |
| -1.445000000000076 | -0.394 | -0.226 | -0.156 |
| -1.440000000000076 | -0.396 | -0.228 | -0.157 |
| -1.435000000000076 | -0.398 | -0.229 | -0.158 |
| -1.430000000000076 | -0.401 | -0.231 | -0.159 |
| -1.425000000000076 | -0.403 | -0.232 | -0.16 |
| -1.420000000000076 | -0.405 | -0.234 | -0.161 |
| -1.415000000000076 | -0.408 | -0.235 | -0.162 |
| -1.410000000000077 | -0.41 | -0.237 | -0.163 |
| -1.405000000000077 | -0.413 | -0.239 | -0.164 |
| -1.400000000000077 | -0.415 | -0.24 | -0.165 |
| -1.395000000000077 | -0.418 | -0.242 | -0.167 |
| -1.390000000000077 | -0.42 | -0.244 | -0.168 |
| -1.385000000000077 | -0.423 | -0.245 | -0.169 |
| -1.380000000000077 | -0.425 | -0.247 | -0.17 |
| -1.375000000000077 | -0.428 | -0.249 | -0.171 |
| -1.370000000000077 | -0.43 | -0.25 | -0.173 |
| -1.365000000000077 | -0.433 | -0.252 | -0.174 |
| -1.360000000000078 | -0.436 | -0.254 | -0.175 |
| -1.355000000000078 | -0.438 | -0.255 | -0.176 |
| -1.350000000000078 | -0.441 | -0.257 | -0.178 |
| -1.345000000000078 | -0.444 | -0.259 | -0.179 |
| -1.340000000000078 | -0.446 | -0.261 | -0.18 |
| -1.335000000000078 | -0.449 | -0.263 | -0.181 |
| -1.330000000000078 | -0.452 | -0.265 | -0.183 |
| -1.325000000000078 | -0.455 | -0.266 | -0.184 |
| -1.320000000000078 | -0.457 | -0.268 | -0.185 |
| -1.315000000000079 | -0.46 | -0.27 | -0.187 |
| -1.310000000000079 | -0.463 | -0.272 | -0.188 |
| -1.305000000000079 | -0.466 | -0.274 | -0.19 |
| -1.300000000000079 | -0.469 | -0.276 | -0.191 |
| -1.295000000000079 | -0.472 | -0.278 | -0.192 |
| -1.29000000000008 | -0.475 | -0.28 | -0.194 |
| -1.285000000000079 | -0.478 | -0.282 | -0.195 |
| -1.280000000000079 | -0.481 | -0.284 | -0.197 |
| -1.275000000000079 | -0.484 | -0.286 | -0.198 |
| -1.270000000000079 | -0.487 | -0.288 | -0.2 |
| -1.26500000000008 | -0.49 | -0.291 | -0.201 |
| -1.26000000000008 | -0.493 | -0.293 | -0.203 |
| -1.25500000000008 | -0.497 | -0.295 | -0.205 |
| -1.25000000000008 | -0.5 | -0.297 | -0.206 |
| -1.24500000000008 | -0.503 | -0.299 | -0.208 |
| -1.24000000000008 | -0.506 | -0.302 | -0.209 |
| -1.23500000000008 | -0.51 | -0.304 | -0.211 |
| -1.23000000000008 | -0.513 | -0.306 | -0.213 |
| -1.22500000000008 | -0.516 | -0.308 | -0.214 |
| -1.220000000000081 | -0.52 | -0.311 | -0.216 |
| -1.215000000000081 | -0.523 | -0.313 | -0.218 |
| -1.210000000000081 | -0.526 | -0.316 | -0.219 |
| -1.205000000000081 | -0.53 | -0.318 | -0.221 |
| -1.200000000000081 | -0.533 | -0.321 | -0.223 |
| -1.195000000000081 | -0.537 | -0.323 | -0.225 |
| -1.190000000000081 | -0.541 | -0.326 | -0.227 |
| -1.185000000000081 | -0.544 | -0.328 | -0.229 |
| -1.180000000000081 | -0.548 | -0.331 | -0.23 |
| -1.175000000000082 | -0.552 | -0.333 | -0.232 |
| -1.170000000000082 | -0.555 | -0.336 | -0.234 |
| -1.165000000000082 | -0.559 | -0.339 | -0.236 |
| -1.160000000000082 | -0.563 | -0.341 | -0.238 |
| -1.155000000000082 | -0.567 | -0.344 | -0.24 |
| -1.150000000000082 | -0.571 | -0.347 | -0.242 |
| -1.145000000000082 | -0.575 | -0.35 | -0.244 |
| -1.140000000000082 | -0.578 | -0.352 | -0.246 |
| -1.135000000000082 | -0.582 | -0.355 | -0.248 |
| -1.130000000000082 | -0.586 | -0.358 | -0.25 |
| -1.125000000000083 | -0.591 | -0.361 | -0.253 |
| -1.120000000000083 | -0.595 | -0.364 | -0.255 |
| -1.115000000000083 | -0.599 | -0.367 | -0.257 |
| -1.110000000000083 | -0.603 | -0.37 | -0.259 |
| -1.105000000000083 | -0.607 | -0.373 | -0.261 |
| -1.100000000000083 | -0.612 | -0.376 | -0.264 |
| -1.095000000000083 | -0.616 | -0.379 | -0.266 |
| -1.090000000000083 | -0.62 | -0.383 | -0.268 |
| -1.085000000000083 | -0.625 | -0.386 | -0.271 |
| -1.080000000000084 | -0.629 | -0.389 | -0.273 |
| -1.075000000000084 | -0.634 | -0.392 | -0.276 |
| -1.070000000000084 | -0.638 | -0.396 | -0.278 |
| -1.065000000000084 | -0.643 | -0.399 | -0.28 |
| -1.060000000000084 | -0.647 | -0.402 | -0.283 |
| -1.055000000000084 | -0.652 | -0.406 | -0.286 |
| -1.050000000000084 | -0.657 | -0.409 | -0.288 |
| -1.045000000000084 | -0.662 | -0.413 | -0.291 |
| -1.040000000000084 | -0.666 | -0.417 | -0.293 |
| -1.035000000000085 | -0.671 | -0.42 | -0.296 |
| -1.030000000000085 | -0.676 | -0.424 | -0.299 |
| -1.025000000000085 | -0.681 | -0.428 | -0.302 |
| -1.020000000000085 | -0.686 | -0.432 | -0.305 |
| -1.015000000000085 | -0.691 | -0.435 | -0.307 |
| -1.010000000000085 | -0.697 | -0.439 | -0.31 |
| -1.005000000000085 | -0.702 | -0.443 | -0.313 |
| -1.000000000000085 | -0.707 | -0.447 | -0.316 |
| -0.995000000000085 | -0.712 | -0.451 | -0.319 |
| -0.990000000000085 | -0.718 | -0.455 | -0.322 |
| -0.985000000000085 | -0.723 | -0.46 | -0.325 |
| -0.980000000000085 | -0.729 | -0.464 | -0.329 |
| -0.975000000000085 | -0.734 | -0.468 | -0.332 |
| -0.970000000000085 | -0.74 | -0.472 | -0.335 |
| -0.965000000000085 | -0.746 | -0.477 | -0.338 |
| -0.960000000000085 | -0.751 | -0.481 | -0.342 |
| -0.955000000000085 | -0.757 | -0.486 | -0.345 |
| -0.950000000000085 | -0.763 | -0.49 | -0.349 |
| -0.945000000000085 | -0.769 | -0.495 | -0.352 |
| -0.940000000000085 | -0.775 | -0.5 | -0.356 |
| -0.935000000000085 | -0.781 | -0.504 | -0.359 |
| -0.930000000000085 | -0.787 | -0.509 | -0.363 |
| -0.925000000000085 | -0.794 | -0.514 | -0.367 |
| -0.920000000000085 | -0.8 | -0.519 | -0.37 |
| -0.915000000000085 | -0.806 | -0.524 | -0.374 |
| -0.910000000000085 | -0.813 | -0.529 | -0.378 |
| -0.905000000000085 | -0.819 | -0.534 | -0.382 |
| -0.900000000000085 | -0.826 | -0.54 | -0.386 |
| -0.895000000000085 | -0.833 | -0.545 | -0.39 |
| -0.890000000000085 | -0.839 | -0.55 | -0.394 |
| -0.885000000000085 | -0.846 | -0.556 | -0.398 |
| -0.880000000000085 | -0.853 | -0.561 | -0.403 |
| -0.875000000000085 | -0.86 | -0.567 | -0.407 |
| -0.870000000000085 | -0.867 | -0.573 | -0.411 |
| -0.865000000000085 | -0.874 | -0.579 | -0.416 |
| -0.860000000000085 | -0.882 | -0.584 | -0.42 |
| -0.855000000000085 | -0.889 | -0.59 | -0.425 |
| -0.850000000000085 | -0.896 | -0.596 | -0.43 |
| -0.845000000000085 | -0.904 | -0.603 | -0.434 |
| -0.840000000000085 | -0.912 | -0.609 | -0.439 |
| -0.835000000000085 | -0.919 | -0.615 | -0.444 |
| -0.830000000000085 | -0.927 | -0.622 | -0.449 |
| -0.825000000000085 | -0.935 | -0.628 | -0.454 |
| -0.820000000000085 | -0.943 | -0.635 | -0.459 |
| -0.815000000000085 | -0.951 | -0.642 | -0.464 |
| -0.810000000000085 | -0.959 | -0.648 | -0.47 |
| -0.805000000000085 | -0.968 | -0.655 | -0.475 |
| -0.800000000000085 | -0.976 | -0.662 | -0.481 |
| -0.795000000000085 | -0.985 | -0.67 | -0.486 |
| -0.790000000000085 | -0.993 | -0.677 | -0.492 |
| -0.785000000000085 | -1.002 | -0.684 | -0.498 |
| -0.780000000000085 | -1.011 | -0.692 | -0.504 |
| -0.775000000000085 | -1.02 | -0.7 | -0.51 |
| -0.770000000000085 | -1.029 | -0.707 | -0.516 |
| -0.765000000000085 | -1.038 | -0.715 | -0.522 |
| -0.760000000000085 | -1.048 | -0.723 | -0.529 |
| -0.755000000000085 | -1.057 | -0.731 | -0.535 |
| -0.750000000000085 | -1.067 | -0.74 | -0.542 |
| -0.745000000000085 | -1.076 | -0.748 | -0.548 |
| -0.740000000000085 | -1.086 | -0.757 | -0.555 |
| -0.735000000000085 | -1.096 | -0.765 | -0.562 |
| -0.730000000000085 | -1.106 | -0.774 | -0.569 |
| -0.725000000000085 | -1.117 | -0.783 | -0.576 |
| -0.720000000000085 | -1.127 | -0.792 | -0.584 |
| -0.715000000000085 | -1.138 | -0.802 | -0.591 |
| -0.710000000000085 | -1.148 | -0.811 | -0.599 |
| -0.705000000000085 | -1.159 | -0.821 | -0.606 |
| -0.700000000000085 | -1.17 | -0.83 | -0.614 |
| -0.695000000000085 | -1.182 | -0.84 | -0.622 |
| -0.690000000000085 | -1.193 | -0.85 | -0.63 |
| -0.685000000000085 | -1.204 | -0.861 | -0.639 |
| -0.680000000000085 | -1.216 | -0.871 | -0.647 |
| -0.675000000000085 | -1.228 | -0.882 | -0.656 |
| -0.670000000000085 | -1.24 | -0.893 | -0.665 |
| -0.665000000000085 | -1.252 | -0.904 | -0.674 |
| -0.660000000000085 | -1.265 | -0.915 | -0.683 |
| -0.655000000000085 | -1.277 | -0.926 | -0.692 |
| -0.650000000000085 | -1.29 | -0.938 | -0.702 |
| -0.645000000000085 | -1.303 | -0.95 | -0.712 |
| -0.640000000000085 | -1.316 | -0.962 | -0.722 |
| -0.635000000000085 | -1.329 | -0.974 | -0.732 |
| -0.630000000000085 | -1.343 | -0.987 | -0.742 |
| -0.625000000000085 | -1.357 | -1 | -0.753 |
| -0.620000000000085 | -1.371 | -1.013 | -0.764 |
| -0.615000000000085 | -1.385 | -1.026 | -0.775 |
| -0.610000000000085 | -1.4 | -1.039 | -0.786 |
| -0.605000000000085 | -1.414 | -1.053 | -0.798 |
| -0.600000000000085 | -1.429 | -1.067 | -0.809 |
| -0.595000000000085 | -1.444 | -1.081 | -0.821 |
| -0.590000000000085 | -1.46 | -1.096 | -0.834 |
| -0.585000000000085 | -1.475 | -1.111 | -0.846 |
| -0.580000000000085 | -1.491 | -1.126 | -0.859 |
| -0.575000000000085 | -1.508 | -1.141 | -0.872 |
| -0.570000000000085 | -1.524 | -1.157 | -0.886 |
| -0.565000000000085 | -1.541 | -1.173 | -0.899 |
| -0.560000000000085 | -1.558 | -1.189 | -0.913 |
| -0.555000000000085 | -1.575 | -1.206 | -0.928 |
| -0.550000000000085 | -1.593 | -1.223 | -0.942 |
| -0.545000000000085 | -1.611 | -1.24 | -0.957 |
| -0.540000000000085 | -1.629 | -1.258 | -0.973 |
| -0.535000000000085 | -1.648 | -1.276 | -0.988 |
| -0.530000000000085 | -1.667 | -1.295 | -1.005 |
| -0.525000000000085 | -1.686 | -1.314 | -1.021 |
| -0.520000000000085 | -1.706 | -1.333 | -1.038 |
| -0.515000000000085 | -1.726 | -1.353 | -1.055 |
| -0.510000000000085 | -1.747 | -1.373 | -1.073 |
| -0.505000000000085 | -1.768 | -1.393 | -1.091 |
| -0.500000000000085 | -1.789 | -1.414 | -1.109 |
| -0.495000000000085 | -1.811 | -1.436 | -1.128 |
| -0.490000000000085 | -1.833 | -1.458 | -1.148 |
| -0.485000000000085 | -1.855 | -1.48 | -1.168 |
| -0.480000000000085 | -1.878 | -1.503 | -1.188 |
| -0.475000000000085 | -1.902 | -1.526 | -1.209 |
| -0.470000000000085 | -1.926 | -1.55 | -1.231 |
| -0.465000000000085 | -1.95 | -1.575 | -1.253 |
| -0.460000000000085 | -1.975 | -1.6 | -1.276 |
| -0.455000000000085 | -2 | -1.626 | -1.299 |
| -0.450000000000085 | -2.026 | -1.652 | -1.323 |
| -0.445000000000085 | -2.053 | -1.679 | -1.347 |
| -0.440000000000085 | -2.08 | -1.706 | -1.372 |
| -0.435000000000085 | -2.108 | -1.734 | -1.398 |
| -0.430000000000085 | -2.136 | -1.763 | -1.425 |
| -0.425000000000085 | -2.165 | -1.793 | -1.452 |
| -0.420000000000085 | -2.195 | -1.823 | -1.48 |
| -0.415000000000085 | -2.226 | -1.854 | -1.509 |
| -0.410000000000085 | -2.257 | -1.886 | -1.539 |
| -0.405000000000085 | -2.289 | -1.919 | -1.569 |
| -0.400000000000085 | -2.321 | -1.952 | -1.6 |
| -0.395000000000085 | -2.355 | -1.987 | -1.633 |
| -0.390000000000085 | -2.389 | -2.022 | -1.666 |
| -0.385000000000085 | -2.424 | -2.058 | -1.7 |
| -0.380000000000085 | -2.46 | -2.095 | -1.735 |
| -0.375000000000085 | -2.497 | -2.133 | -1.772 |
| -0.370000000000085 | -2.535 | -2.173 | -1.809 |
| -0.365000000000085 | -2.574 | -2.213 | -1.848 |
| -0.360000000000085 | -2.614 | -2.254 | -1.887 |
| -0.355000000000085 | -2.655 | -2.297 | -1.928 |
| -0.350000000000085 | -2.697 | -2.341 | -1.97 |
| -0.345000000000085 | -2.74 | -2.386 | -2.014 |
| -0.340000000000085 | -2.785 | -2.432 | -2.059 |
| -0.335000000000085 | -2.83 | -2.48 | -2.105 |
| -0.330000000000085 | -2.878 | -2.529 | -2.153 |
| -0.325000000000085 | -2.926 | -2.58 | -2.203 |
| -0.320000000000085 | -2.976 | -2.632 | -2.254 |
| -0.315000000000085 | -3.028 | -2.686 | -2.307 |
| -0.310000000000085 | -3.081 | -2.742 | -2.362 |
| -0.305000000000085 | -3.136 | -2.799 | -2.419 |
| -0.300000000000085 | -3.193 | -2.858 | -2.478 |
| -0.295000000000085 | -3.251 | -2.92 | -2.538 |
| -0.290000000000085 | -3.312 | -2.983 | -2.602 |
| -0.285000000000085 | -3.374 | -3.048 | -2.667 |
| -0.280000000000085 | -3.439 | -3.116 | -2.735 |
| -0.275000000000085 | -3.506 | -3.186 | -2.805 |
| -0.270000000000085 | -3.576 | -3.259 | -2.878 |
| -0.265000000000085 | -3.648 | -3.334 | -2.954 |
| -0.260000000000085 | -3.722 | -3.412 | -3.033 |
| -0.255000000000085 | -3.8 | -3.493 | -3.115 |
| -0.250000000000085 | -3.881 | -3.578 | -3.2 |
| -0.245000000000085 | -3.964 | -3.665 | -3.289 |
| -0.240000000000085 | -4.052 | -3.756 | -3.381 |
| -0.235000000000085 | -4.142 | -3.851 | -3.478 |
| -0.230000000000085 | -4.237 | -3.95 | -3.579 |
| -0.225000000000085 | -4.336 | -4.053 | -3.684 |
| -0.220000000000085 | -4.439 | -4.161 | -3.794 |
| -0.215000000000085 | -4.547 | -4.273 | -3.909 |
| -0.210000000000085 | -4.66 | -4.39 | -4.029 |
| -0.205000000000085 | -4.779 | -4.513 | -4.155 |
| -0.200000000000085 | -4.903 | -4.642 | -4.287 |
| -0.195000000000085 | -5.033 | -4.778 | -4.426 |
| -0.190000000000085 | -5.171 | -4.92 | -4.573 |
| -0.185000000000085 | -5.315 | -5.07 | -4.726 |
| -0.180000000000085 | -5.468 | -5.227 | -4.888 |
| -0.175000000000085 | -5.629 | -5.393 | -5.059 |
| -0.170000000000085 | -5.799 | -5.569 | -5.24 |
| -0.165000000000085 | -5.98 | -5.755 | -5.432 |
| -0.160000000000085 | -6.172 | -5.953 | -5.635 |
| -0.155000000000084 | -6.375 | -6.162 | -5.85 |
| -0.150000000000084 | -6.593 | -6.386 | -6.079 |
| -0.145000000000084 | -6.825 | -6.624 | -6.324 |
| -0.140000000000084 | -7.074 | -6.878 | -6.586 |
| -0.135000000000084 | -7.341 | -7.151 | -6.866 |
| -0.130000000000084 | -7.628 | -7.445 | -7.167 |
| -0.125000000000084 | -7.938 | -7.761 | -7.491 |
| -0.120000000000084 | -8.274 | -8.103 | -7.841 |
| -0.115000000000084 | -8.639 | -8.474 | -8.22 |
| -0.110000000000084 | -9.036 | -8.879 | -8.633 |
| -0.105000000000084 | -9.472 | -9.321 | -9.084 |
| -0.100000000000084 | -9.95 | -9.806 | -9.578 |
| -0.0950000000000844 | -10.479 | -10.341 | -10.123 |
| -0.0900000000000844 | -11.066 | -10.935 | -10.727 |
| -0.0850000000000844 | -11.722 | -11.598 | -11.4 |
| -0.0800000000000844 | -12.46 | -12.343 | -12.155 |
| -0.0750000000000844 | -13.296 | -13.186 | -13.008 |
| -0.0700000000000844 | -14.251 | -14.148 | -13.981 |
| -0.0650000000000844 | -15.352 | -15.256 | -15.1 |
| -0.0600000000000844 | -16.637 | -16.548 | -16.403 |
| -0.0550000000000844 | -18.154 | -18.073 | -17.939 |
| -0.0500000000000844 | -19.975 | -19.901 | -19.779 |
| -0.0450000000000844 | -22.2 | -22.133 | -22.022 |
| -0.0400000000000844 | -24.98 | -24.92 | -24.822 |
| -0.0350000000000844 | -28.554 | -28.502 | -28.415 |
| -0.0300000000000844 | -33.318 | -33.273 | -33.199 |
| -0.0250000000000844 | -39.988 | -39.95 | -39.888 |
| -0.0200000000000844 | -49.99 | -49.96 | -49.91 |
| -0.0150000000000844 | -66.659 | -66.637 | -66.599 |
| -0.0100000000000844 | -99.995 | -99.98 | -99.955 |
| -0.00500000000008444 | -199.998 | -199.99 | -199.978 |
| -8.4444604087075e-14 | -11842082875643 | -11842082875643 | -11842082875643 |
| 0.00499999999991555 | -199.998 | -199.99 | -199.978 |
| 0.00999999999991555 | -99.995 | -99.98 | -99.955 |
| 0.0149999999999156 | -66.659 | -66.637 | -66.599 |
| 0.0199999999999156 | -49.99 | -49.96 | -49.91 |
| 0.0249999999999156 | -39.988 | -39.95 | -39.888 |
| 0.0299999999999156 | -33.318 | -33.273 | -33.199 |
| 0.0349999999999155 | -28.554 | -28.502 | -28.415 |
| 0.0399999999999155 | -24.98 | -24.92 | -24.822 |
| 0.0449999999999155 | -22.2 | -22.133 | -22.022 |
| 0.0499999999999155 | -19.975 | -19.901 | -19.779 |
| 0.0549999999999155 | -18.154 | -18.073 | -17.939 |
| 0.0599999999999155 | -16.637 | -16.548 | -16.403 |
| 0.0649999999999155 | -15.352 | -15.256 | -15.1 |
| 0.0699999999999155 | -14.251 | -14.148 | -13.981 |
| 0.0749999999999155 | -13.296 | -13.186 | -13.008 |
| 0.0799999999999155 | -12.46 | -12.343 | -12.155 |
| 0.0849999999999155 | -11.722 | -11.598 | -11.4 |
| 0.0899999999999155 | -11.066 | -10.935 | -10.727 |
| 0.0949999999999155 | -10.479 | -10.341 | -10.123 |
| 0.0999999999999155 | -9.95 | -9.806 | -9.578 |
| 0.104999999999916 | -9.472 | -9.321 | -9.084 |
| 0.109999999999916 | -9.036 | -8.879 | -8.633 |
| 0.114999999999916 | -8.639 | -8.474 | -8.22 |
| 0.119999999999916 | -8.274 | -8.103 | -7.841 |
| 0.124999999999916 | -7.938 | -7.761 | -7.491 |
| 0.129999999999916 | -7.628 | -7.445 | -7.167 |
| 0.134999999999916 | -7.341 | -7.151 | -6.866 |
| 0.139999999999916 | -7.074 | -6.878 | -6.586 |
| 0.144999999999916 | -6.825 | -6.624 | -6.324 |
| 0.149999999999916 | -6.593 | -6.386 | -6.079 |
| 0.154999999999916 | -6.375 | -6.162 | -5.85 |
| 0.159999999999916 | -6.172 | -5.953 | -5.635 |
| 0.164999999999916 | -5.98 | -5.755 | -5.432 |
| 0.169999999999916 | -5.799 | -5.569 | -5.24 |
| 0.174999999999916 | -5.629 | -5.393 | -5.059 |
| 0.179999999999916 | -5.468 | -5.227 | -4.888 |
| 0.184999999999916 | -5.315 | -5.07 | -4.726 |
| 0.189999999999916 | -5.171 | -4.92 | -4.573 |
| 0.194999999999916 | -5.033 | -4.778 | -4.426 |
| 0.199999999999916 | -4.903 | -4.642 | -4.287 |
| 0.204999999999916 | -4.779 | -4.513 | -4.155 |
| 0.209999999999916 | -4.66 | -4.39 | -4.029 |
| 0.214999999999916 | -4.547 | -4.273 | -3.909 |
| 0.219999999999916 | -4.439 | -4.161 | -3.794 |
| 0.224999999999916 | -4.336 | -4.053 | -3.684 |
| 0.229999999999916 | -4.237 | -3.95 | -3.579 |
| 0.234999999999916 | -4.142 | -3.851 | -3.478 |
| 0.239999999999916 | -4.052 | -3.756 | -3.381 |
| 0.244999999999916 | -3.964 | -3.665 | -3.289 |
| 0.249999999999916 | -3.881 | -3.578 | -3.2 |
| 0.254999999999916 | -3.8 | -3.493 | -3.115 |
| 0.259999999999916 | -3.722 | -3.412 | -3.033 |
| 0.264999999999916 | -3.648 | -3.334 | -2.954 |
| 0.269999999999916 | -3.576 | -3.259 | -2.878 |
| 0.274999999999916 | -3.506 | -3.186 | -2.805 |
| 0.279999999999916 | -3.439 | -3.116 | -2.735 |
| 0.284999999999916 | -3.374 | -3.048 | -2.667 |
| 0.289999999999916 | -3.312 | -2.983 | -2.602 |
| 0.294999999999916 | -3.251 | -2.92 | -2.538 |
| 0.299999999999916 | -3.193 | -2.858 | -2.478 |
| 0.304999999999916 | -3.136 | -2.799 | -2.419 |
| 0.309999999999916 | -3.081 | -2.742 | -2.362 |
| 0.314999999999916 | -3.028 | -2.686 | -2.307 |
| 0.319999999999916 | -2.976 | -2.632 | -2.254 |
| 0.324999999999916 | -2.926 | -2.58 | -2.203 |
| 0.329999999999916 | -2.878 | -2.529 | -2.153 |
| 0.334999999999916 | -2.83 | -2.48 | -2.105 |
| 0.339999999999916 | -2.785 | -2.432 | -2.059 |
| 0.344999999999916 | -2.74 | -2.386 | -2.014 |
| 0.349999999999916 | -2.697 | -2.341 | -1.97 |
| 0.354999999999916 | -2.655 | -2.297 | -1.928 |
| 0.359999999999916 | -2.614 | -2.254 | -1.887 |
| 0.364999999999916 | -2.574 | -2.213 | -1.848 |
| 0.369999999999916 | -2.535 | -2.173 | -1.809 |
| 0.374999999999916 | -2.497 | -2.133 | -1.772 |
| 0.379999999999916 | -2.46 | -2.095 | -1.735 |
| 0.384999999999916 | -2.424 | -2.058 | -1.7 |
| 0.389999999999916 | -2.389 | -2.022 | -1.666 |
| 0.394999999999916 | -2.355 | -1.987 | -1.633 |
| 0.399999999999916 | -2.321 | -1.952 | -1.6 |
| 0.404999999999916 | -2.289 | -1.919 | -1.569 |
| 0.409999999999916 | -2.257 | -1.886 | -1.539 |
| 0.414999999999916 | -2.226 | -1.854 | -1.509 |
| 0.419999999999916 | -2.195 | -1.823 | -1.48 |
| 0.424999999999916 | -2.165 | -1.793 | -1.452 |
| 0.429999999999916 | -2.136 | -1.763 | -1.425 |
| 0.434999999999916 | -2.108 | -1.734 | -1.398 |
| 0.439999999999916 | -2.08 | -1.706 | -1.372 |
| 0.444999999999916 | -2.053 | -1.679 | -1.347 |
| 0.449999999999916 | -2.026 | -1.652 | -1.323 |
| 0.454999999999916 | -2 | -1.626 | -1.299 |
| 0.459999999999916 | -1.975 | -1.6 | -1.276 |
| 0.464999999999916 | -1.95 | -1.575 | -1.253 |
| 0.469999999999916 | -1.926 | -1.55 | -1.231 |
| 0.474999999999916 | -1.902 | -1.526 | -1.209 |
| 0.479999999999916 | -1.878 | -1.503 | -1.188 |
| 0.484999999999916 | -1.855 | -1.48 | -1.168 |
| 0.489999999999916 | -1.833 | -1.458 | -1.148 |
| 0.494999999999916 | -1.811 | -1.436 | -1.128 |
| 0.499999999999916 | -1.789 | -1.414 | -1.109 |
| 0.504999999999916 | -1.768 | -1.393 | -1.091 |
| 0.509999999999916 | -1.747 | -1.373 | -1.073 |
| 0.514999999999916 | -1.726 | -1.353 | -1.055 |
| 0.519999999999916 | -1.706 | -1.333 | -1.038 |
| 0.524999999999916 | -1.686 | -1.314 | -1.021 |
| 0.529999999999916 | -1.667 | -1.295 | -1.005 |
| 0.534999999999916 | -1.648 | -1.276 | -0.988 |
| 0.539999999999916 | -1.629 | -1.258 | -0.973 |
| 0.544999999999916 | -1.611 | -1.24 | -0.957 |
| 0.549999999999916 | -1.593 | -1.223 | -0.942 |
| 0.554999999999916 | -1.575 | -1.206 | -0.928 |
| 0.559999999999916 | -1.558 | -1.189 | -0.913 |
| 0.564999999999916 | -1.541 | -1.173 | -0.899 |
| 0.569999999999916 | -1.524 | -1.157 | -0.886 |
| 0.574999999999916 | -1.508 | -1.141 | -0.872 |
| 0.579999999999916 | -1.491 | -1.126 | -0.859 |
| 0.584999999999916 | -1.475 | -1.111 | -0.846 |
| 0.589999999999916 | -1.46 | -1.096 | -0.834 |
| 0.594999999999916 | -1.444 | -1.081 | -0.821 |
| 0.599999999999916 | -1.429 | -1.067 | -0.809 |
| 0.604999999999916 | -1.414 | -1.053 | -0.798 |
| 0.609999999999916 | -1.4 | -1.039 | -0.786 |
| 0.614999999999916 | -1.385 | -1.026 | -0.775 |
| 0.619999999999916 | -1.371 | -1.013 | -0.764 |
| 0.624999999999916 | -1.357 | -1 | -0.753 |
| 0.629999999999916 | -1.343 | -0.987 | -0.742 |
| 0.634999999999916 | -1.329 | -0.974 | -0.732 |
| 0.639999999999916 | -1.316 | -0.962 | -0.722 |
| 0.644999999999916 | -1.303 | -0.95 | -0.712 |
| 0.649999999999916 | -1.29 | -0.938 | -0.702 |
| 0.654999999999916 | -1.277 | -0.926 | -0.692 |
| 0.659999999999916 | -1.265 | -0.915 | -0.683 |
| 0.664999999999916 | -1.252 | -0.904 | -0.674 |
| 0.669999999999916 | -1.24 | -0.893 | -0.665 |
| 0.674999999999916 | -1.228 | -0.882 | -0.656 |
| 0.679999999999916 | -1.216 | -0.871 | -0.647 |
| 0.684999999999916 | -1.204 | -0.861 | -0.639 |
| 0.689999999999916 | -1.193 | -0.85 | -0.63 |
| 0.694999999999916 | -1.182 | -0.84 | -0.622 |
| 0.699999999999916 | -1.17 | -0.83 | -0.614 |
| 0.704999999999916 | -1.159 | -0.821 | -0.606 |
| 0.709999999999916 | -1.148 | -0.811 | -0.599 |
| 0.714999999999916 | -1.138 | -0.802 | -0.591 |
| 0.719999999999916 | -1.127 | -0.792 | -0.584 |
| 0.724999999999916 | -1.117 | -0.783 | -0.576 |
| 0.729999999999916 | -1.106 | -0.774 | -0.569 |
| 0.734999999999916 | -1.096 | -0.765 | -0.562 |
| 0.739999999999916 | -1.086 | -0.757 | -0.555 |
| 0.744999999999916 | -1.076 | -0.748 | -0.548 |
| 0.749999999999916 | -1.067 | -0.74 | -0.542 |
| 0.754999999999916 | -1.057 | -0.731 | -0.535 |
| 0.759999999999916 | -1.048 | -0.723 | -0.529 |
| 0.764999999999916 | -1.038 | -0.715 | -0.522 |
| 0.769999999999916 | -1.029 | -0.707 | -0.516 |
| 0.774999999999916 | -1.02 | -0.7 | -0.51 |
| 0.779999999999916 | -1.011 | -0.692 | -0.504 |
| 0.784999999999916 | -1.002 | -0.684 | -0.498 |
| 0.789999999999916 | -0.993 | -0.677 | -0.492 |
| 0.794999999999916 | -0.985 | -0.67 | -0.486 |
| 0.799999999999916 | -0.976 | -0.662 | -0.481 |
| 0.804999999999916 | -0.968 | -0.655 | -0.475 |
| 0.809999999999916 | -0.959 | -0.648 | -0.47 |
| 0.814999999999916 | -0.951 | -0.642 | -0.464 |
| 0.819999999999916 | -0.943 | -0.635 | -0.459 |
| 0.824999999999916 | -0.935 | -0.628 | -0.454 |
| 0.829999999999916 | -0.927 | -0.622 | -0.449 |
| 0.834999999999916 | -0.919 | -0.615 | -0.444 |
| 0.839999999999916 | -0.912 | -0.609 | -0.439 |
| 0.844999999999916 | -0.904 | -0.603 | -0.434 |
| 0.849999999999916 | -0.896 | -0.596 | -0.43 |
| 0.854999999999916 | -0.889 | -0.59 | -0.425 |
| 0.859999999999916 | -0.882 | -0.584 | -0.42 |
| 0.864999999999916 | -0.874 | -0.579 | -0.416 |
| 0.869999999999916 | -0.867 | -0.573 | -0.411 |
| 0.874999999999916 | -0.86 | -0.567 | -0.407 |
| 0.879999999999916 | -0.853 | -0.561 | -0.403 |
| 0.884999999999916 | -0.846 | -0.556 | -0.398 |
| 0.889999999999916 | -0.839 | -0.55 | -0.394 |
| 0.894999999999916 | -0.833 | -0.545 | -0.39 |
| 0.899999999999916 | -0.826 | -0.54 | -0.386 |
| 0.904999999999916 | -0.819 | -0.534 | -0.382 |
| 0.909999999999916 | -0.813 | -0.529 | -0.378 |
| 0.914999999999916 | -0.806 | -0.524 | -0.374 |
| 0.919999999999916 | -0.8 | -0.519 | -0.37 |
| 0.924999999999916 | -0.794 | -0.514 | -0.367 |
| 0.929999999999916 | -0.787 | -0.509 | -0.363 |
| 0.934999999999916 | -0.781 | -0.504 | -0.359 |
| 0.939999999999916 | -0.775 | -0.5 | -0.356 |
| 0.944999999999916 | -0.769 | -0.495 | -0.352 |
| 0.949999999999916 | -0.763 | -0.49 | -0.349 |
| 0.954999999999916 | -0.757 | -0.486 | -0.345 |
| 0.959999999999916 | -0.751 | -0.481 | -0.342 |
| 0.964999999999916 | -0.746 | -0.477 | -0.338 |
| 0.969999999999916 | -0.74 | -0.472 | -0.335 |
| 0.974999999999916 | -0.734 | -0.468 | -0.332 |
| 0.979999999999916 | -0.729 | -0.464 | -0.329 |
| 0.984999999999916 | -0.723 | -0.46 | -0.325 |
| 0.989999999999916 | -0.718 | -0.455 | -0.322 |
| 0.994999999999916 | -0.712 | -0.451 | -0.319 |
| 0.999999999999916 | -0.707 | -0.447 | -0.316 |
| 1.004999999999916 | -0.702 | -0.443 | -0.313 |
| 1.009999999999916 | -0.697 | -0.439 | -0.31 |
| 1.014999999999916 | -0.691 | -0.435 | -0.307 |
| 1.019999999999916 | -0.686 | -0.432 | -0.305 |
| 1.024999999999916 | -0.681 | -0.428 | -0.302 |
| 1.029999999999916 | -0.676 | -0.424 | -0.299 |
| 1.034999999999916 | -0.671 | -0.42 | -0.296 |
| 1.039999999999915 | -0.666 | -0.417 | -0.293 |
| 1.044999999999915 | -0.662 | -0.413 | -0.291 |
| 1.049999999999915 | -0.657 | -0.409 | -0.288 |
| 1.054999999999915 | -0.652 | -0.406 | -0.286 |
| 1.059999999999915 | -0.647 | -0.402 | -0.283 |
| 1.064999999999915 | -0.643 | -0.399 | -0.28 |
| 1.069999999999915 | -0.638 | -0.396 | -0.278 |
| 1.074999999999915 | -0.634 | -0.392 | -0.276 |
| 1.079999999999915 | -0.629 | -0.389 | -0.273 |
| 1.084999999999914 | -0.625 | -0.386 | -0.271 |
| 1.089999999999914 | -0.62 | -0.383 | -0.268 |
| 1.094999999999914 | -0.616 | -0.379 | -0.266 |
| 1.099999999999914 | -0.612 | -0.376 | -0.264 |
| 1.104999999999914 | -0.607 | -0.373 | -0.261 |
| 1.109999999999914 | -0.603 | -0.37 | -0.259 |
| 1.114999999999914 | -0.599 | -0.367 | -0.257 |
| 1.119999999999914 | -0.595 | -0.364 | -0.255 |
| 1.124999999999914 | -0.591 | -0.361 | -0.253 |
| 1.129999999999914 | -0.586 | -0.358 | -0.25 |
| 1.134999999999913 | -0.582 | -0.355 | -0.248 |
| 1.139999999999913 | -0.578 | -0.352 | -0.246 |
| 1.144999999999913 | -0.575 | -0.35 | -0.244 |
| 1.149999999999913 | -0.571 | -0.347 | -0.242 |
| 1.154999999999913 | -0.567 | -0.344 | -0.24 |
| 1.159999999999913 | -0.563 | -0.341 | -0.238 |
| 1.164999999999913 | -0.559 | -0.339 | -0.236 |
| 1.169999999999913 | -0.555 | -0.336 | -0.234 |
| 1.174999999999913 | -0.552 | -0.333 | -0.232 |
| 1.179999999999912 | -0.548 | -0.331 | -0.23 |
| 1.184999999999912 | -0.544 | -0.328 | -0.229 |
| 1.189999999999912 | -0.541 | -0.326 | -0.227 |
| 1.194999999999912 | -0.537 | -0.323 | -0.225 |
| 1.199999999999912 | -0.533 | -0.321 | -0.223 |
| 1.204999999999912 | -0.53 | -0.318 | -0.221 |
| 1.209999999999912 | -0.526 | -0.316 | -0.219 |
| 1.214999999999912 | -0.523 | -0.313 | -0.218 |
| 1.219999999999912 | -0.52 | -0.311 | -0.216 |
| 1.224999999999911 | -0.516 | -0.308 | -0.214 |
| 1.229999999999911 | -0.513 | -0.306 | -0.213 |
| 1.234999999999911 | -0.51 | -0.304 | -0.211 |
| 1.239999999999911 | -0.506 | -0.302 | -0.209 |
| 1.244999999999911 | -0.503 | -0.299 | -0.208 |
| 1.249999999999911 | -0.5 | -0.297 | -0.206 |
| 1.254999999999911 | -0.497 | -0.295 | -0.205 |
| 1.259999999999911 | -0.493 | -0.293 | -0.203 |
| 1.264999999999911 | -0.49 | -0.291 | -0.201 |
| 1.269999999999911 | -0.487 | -0.288 | -0.2 |
| 1.27499999999991 | -0.484 | -0.286 | -0.198 |
| 1.27999999999991 | -0.481 | -0.284 | -0.197 |
| 1.28499999999991 | -0.478 | -0.282 | -0.195 |
| 1.28999999999991 | -0.475 | -0.28 | -0.194 |
| 1.29499999999991 | -0.472 | -0.278 | -0.192 |
| 1.29999999999991 | -0.469 | -0.276 | -0.191 |
| 1.30499999999991 | -0.466 | -0.274 | -0.19 |
| 1.30999999999991 | -0.463 | -0.272 | -0.188 |
| 1.31499999999991 | -0.46 | -0.27 | -0.187 |
| 1.319999999999909 | -0.457 | -0.268 | -0.185 |
| 1.324999999999909 | -0.455 | -0.266 | -0.184 |
| 1.329999999999909 | -0.452 | -0.265 | -0.183 |
| 1.334999999999909 | -0.449 | -0.263 | -0.181 |
| 1.339999999999909 | -0.446 | -0.261 | -0.18 |
| 1.344999999999909 | -0.444 | -0.259 | -0.179 |
| 1.349999999999909 | -0.441 | -0.257 | -0.178 |
| 1.354999999999909 | -0.438 | -0.255 | -0.176 |
| 1.359999999999909 | -0.436 | -0.254 | -0.175 |
| 1.364999999999908 | -0.433 | -0.252 | -0.174 |
| 1.369999999999908 | -0.43 | -0.25 | -0.173 |
| 1.374999999999908 | -0.428 | -0.249 | -0.171 |
| 1.379999999999908 | -0.425 | -0.247 | -0.17 |
| 1.384999999999908 | -0.423 | -0.245 | -0.169 |
| 1.389999999999908 | -0.42 | -0.244 | -0.168 |
| 1.394999999999908 | -0.418 | -0.242 | -0.167 |
| 1.399999999999908 | -0.415 | -0.24 | -0.165 |
| 1.404999999999908 | -0.413 | -0.239 | -0.164 |
| 1.409999999999908 | -0.41 | -0.237 | -0.163 |
| 1.414999999999907 | -0.408 | -0.235 | -0.162 |
| 1.419999999999907 | -0.405 | -0.234 | -0.161 |
| 1.424999999999907 | -0.403 | -0.232 | -0.16 |
| 1.429999999999907 | -0.401 | -0.231 | -0.159 |
| 1.434999999999907 | -0.398 | -0.229 | -0.158 |
| 1.439999999999907 | -0.396 | -0.228 | -0.157 |
| 1.444999999999907 | -0.394 | -0.226 | -0.156 |
| 1.449999999999907 | -0.392 | -0.225 | -0.155 |
| 1.454999999999907 | -0.389 | -0.223 | -0.153 |
| 1.459999999999906 | -0.387 | -0.222 | -0.152 |
| 1.464999999999906 | -0.385 | -0.22 | -0.151 |
| 1.469999999999906 | -0.383 | -0.219 | -0.15 |
| 1.474999999999906 | -0.38 | -0.218 | -0.149 |
| 1.479999999999906 | -0.378 | -0.216 | -0.148 |
| 1.484999999999906 | -0.376 | -0.215 | -0.147 |
| 1.489999999999906 | -0.374 | -0.214 | -0.147 |
| 1.494999999999906 | -0.372 | -0.212 | -0.146 |
| 1.499999999999906 | -0.37 | -0.211 | -0.145 |
| 1.504999999999906 | -0.368 | -0.209 | -0.144 |
| 1.509999999999905 | -0.366 | -0.208 | -0.143 |
| 1.514999999999905 | -0.364 | -0.207 | -0.142 |
| 1.519999999999905 | -0.362 | -0.206 | -0.141 |
| 1.524999999999905 | -0.36 | -0.204 | -0.14 |
| 1.529999999999905 | -0.358 | -0.203 | -0.139 |
| 1.534999999999905 | -0.356 | -0.202 | -0.138 |
| 1.539999999999905 | -0.354 | -0.201 | -0.137 |
| 1.544999999999905 | -0.352 | -0.199 | -0.137 |
| 1.549999999999905 | -0.35 | -0.198 | -0.136 |
| 1.554999999999904 | -0.348 | -0.197 | -0.135 |
| 1.559999999999904 | -0.346 | -0.196 | -0.134 |
| 1.564999999999904 | -0.344 | -0.194 | -0.133 |
| 1.569999999999904 | -0.342 | -0.193 | -0.132 |
| 1.574999999999904 | -0.34 | -0.192 | -0.131 |
| 1.579999999999904 | -0.338 | -0.191 | -0.131 |
| 1.584999999999904 | -0.337 | -0.19 | -0.13 |
| 1.589999999999904 | -0.335 | -0.189 | -0.129 |
| 1.594999999999904 | -0.333 | -0.188 | -0.128 |
| 1.599999999999903 | -0.331 | -0.186 | -0.127 |
| 1.604999999999903 | -0.329 | -0.185 | -0.127 |
| 1.609999999999903 | -0.328 | -0.184 | -0.126 |
| 1.614999999999903 | -0.326 | -0.183 | -0.125 |
| 1.619999999999903 | -0.324 | -0.182 | -0.124 |
| 1.624999999999903 | -0.323 | -0.181 | -0.124 |
| 1.629999999999903 | -0.321 | -0.18 | -0.123 |
| 1.634999999999903 | -0.319 | -0.179 | -0.122 |
| 1.639999999999903 | -0.317 | -0.178 | -0.121 |
| 1.644999999999902 | -0.316 | -0.177 | -0.121 |
| 1.649999999999902 | -0.314 | -0.176 | -0.12 |
| 1.654999999999902 | -0.312 | -0.175 | -0.119 |
| 1.659999999999902 | -0.311 | -0.174 | -0.119 |
| 1.664999999999902 | -0.309 | -0.173 | -0.118 |
| 1.669999999999902 | -0.308 | -0.172 | -0.117 |
| 1.674999999999902 | -0.306 | -0.171 | -0.117 |
| 1.679999999999902 | -0.304 | -0.17 | -0.116 |
| 1.684999999999902 | -0.303 | -0.169 | -0.115 |
| 1.689999999999901 | -0.301 | -0.168 | -0.115 |
| 1.694999999999901 | -0.3 | -0.167 | -0.114 |
| 1.699999999999901 | -0.298 | -0.166 | -0.113 |
| 1.704999999999901 | -0.297 | -0.165 | -0.113 |
| 1.709999999999901 | -0.295 | -0.164 | -0.112 |
| 1.714999999999901 | -0.294 | -0.163 | -0.111 |
| 1.719999999999901 | -0.292 | -0.162 | -0.111 |
| 1.724999999999901 | -0.291 | -0.161 | -0.11 |
| 1.729999999999901 | -0.289 | -0.16 | -0.109 |
| 1.734999999999901 | -0.288 | -0.16 | -0.109 |
| 1.7399999999999 | -0.286 | -0.159 | -0.108 |
| 1.7449999999999 | -0.285 | -0.158 | -0.108 |
| 1.7499999999999 | -0.284 | -0.157 | -0.107 |
| 1.7549999999999 | -0.282 | -0.156 | -0.106 |
| 1.7599999999999 | -0.281 | -0.155 | -0.106 |
| 1.7649999999999 | -0.279 | -0.154 | -0.105 |
| 1.7699999999999 | -0.278 | -0.154 | -0.105 |
| 1.7749999999999 | -0.277 | -0.153 | -0.104 |
| 1.7799999999999 | -0.275 | -0.152 | -0.103 |
| 1.784999999999899 | -0.274 | -0.151 | -0.103 |
| 1.789999999999899 | -0.272 | -0.15 | -0.102 |
| 1.794999999999899 | -0.271 | -0.149 | -0.102 |
| 1.799999999999899 | -0.27 | -0.149 | -0.101 |
| 1.804999999999899 | -0.268 | -0.148 | -0.101 |
| 1.809999999999899 | -0.267 | -0.147 | -0.1 |
| 1.814999999999899 | -0.266 | -0.146 | -0.1 |
| 1.819999999999899 | -0.265 | -0.146 | -0.099 |
| 1.824999999999899 | -0.263 | -0.145 | -0.098 |
| 1.829999999999899 | -0.262 | -0.144 | -0.098 |
| 1.834999999999898 | -0.261 | -0.143 | -0.097 |
| 1.839999999999898 | -0.26 | -0.143 | -0.097 |
| 1.844999999999898 | -0.258 | -0.142 | -0.096 |
| 1.849999999999898 | -0.257 | -0.141 | -0.096 |
| 1.854999999999898 | -0.256 | -0.14 | -0.095 |
| 1.859999999999898 | -0.255 | -0.14 | -0.095 |
| 1.864999999999898 | -0.253 | -0.139 | -0.094 |
| 1.869999999999898 | -0.252 | -0.138 | -0.094 |
| 1.874999999999898 | -0.251 | -0.137 | -0.093 |
| 1.879999999999897 | -0.25 | -0.137 | -0.093 |
| 1.884999999999897 | -0.249 | -0.136 | -0.092 |
| 1.889999999999897 | -0.247 | -0.135 | -0.092 |
| 1.894999999999897 | -0.246 | -0.135 | -0.091 |
| 1.899999999999897 | -0.245 | -0.134 | -0.091 |
| 1.904999999999897 | -0.244 | -0.133 | -0.09 |
| 1.909999999999897 | -0.243 | -0.133 | -0.09 |
| 1.914999999999897 | -0.242 | -0.132 | -0.09 |
| 1.919999999999897 | -0.241 | -0.131 | -0.089 |
| 1.924999999999897 | -0.239 | -0.131 | -0.089 |
| 1.929999999999896 | -0.238 | -0.13 | -0.088 |
| 1.934999999999896 | -0.237 | -0.129 | -0.088 |
| 1.939999999999896 | -0.236 | -0.129 | -0.087 |
| 1.944999999999896 | -0.235 | -0.128 | -0.087 |
| 1.949999999999896 | -0.234 | -0.127 | -0.086 |
| 1.954999999999896 | -0.233 | -0.127 | -0.086 |
| 1.959999999999896 | -0.232 | -0.126 | -0.086 |
| 1.964999999999896 | -0.231 | -0.125 | -0.085 |
| 1.969999999999896 | -0.23 | -0.125 | -0.085 |
| 1.974999999999895 | -0.229 | -0.124 | -0.084 |
| 1.979999999999895 | -0.228 | -0.124 | -0.084 |
| 1.984999999999895 | -0.227 | -0.123 | -0.083 |
| 1.989999999999895 | -0.226 | -0.122 | -0.083 |
| 1.994999999999895 | -0.225 | -0.122 | -0.083 |
| 1.999999999999895 | -0.224 | -0.121 | -0.082 |
| 2.004999999999895 | -0.223 | -0.121 | -0.082 |
| 2.009999999999895 | -0.222 | -0.12 | -0.081 |
| 2.014999999999895 | -0.221 | -0.12 | -0.081 |
| 2.019999999999895 | -0.22 | -0.119 | -0.081 |
| 2.024999999999895 | -0.219 | -0.118 | -0.08 |
| 2.029999999999895 | -0.218 | -0.118 | -0.08 |
| 2.034999999999894 | -0.217 | -0.117 | -0.079 |
| 2.039999999999894 | -0.216 | -0.117 | -0.079 |
| 2.044999999999894 | -0.215 | -0.116 | -0.079 |
| 2.049999999999894 | -0.214 | -0.116 | -0.078 |
| 2.054999999999894 | -0.213 | -0.115 | -0.078 |
| 2.059999999999894 | -0.212 | -0.115 | -0.078 |
| 2.064999999999894 | -0.211 | -0.114 | -0.077 |
| 2.069999999999894 | -0.21 | -0.113 | -0.077 |
| 2.074999999999894 | -0.209 | -0.113 | -0.076 |
| 2.079999999999893 | -0.208 | -0.112 | -0.076 |
| 2.084999999999893 | -0.207 | -0.112 | -0.076 |
| 2.089999999999893 | -0.207 | -0.111 | -0.075 |
| 2.094999999999893 | -0.206 | -0.111 | -0.075 |
| 2.099999999999893 | -0.205 | -0.11 | -0.075 |
| 2.104999999999893 | -0.204 | -0.11 | -0.074 |
| 2.109999999999893 | -0.203 | -0.109 | -0.074 |
| 2.114999999999893 | -0.202 | -0.109 | -0.074 |
| 2.119999999999893 | -0.201 | -0.108 | -0.073 |
| 2.124999999999893 | -0.2 | -0.108 | -0.073 |
| 2.129999999999892 | -0.2 | -0.107 | -0.073 |
| 2.134999999999892 | -0.199 | -0.107 | -0.072 |
| 2.139999999999892 | -0.198 | -0.106 | -0.072 |
| 2.144999999999892 | -0.197 | -0.106 | -0.072 |
| 2.149999999999892 | -0.196 | -0.105 | -0.071 |
| 2.154999999999892 | -0.195 | -0.105 | -0.071 |
| 2.159999999999892 | -0.195 | -0.104 | -0.071 |
| 2.164999999999892 | -0.194 | -0.104 | -0.07 |
| 2.169999999999892 | -0.193 | -0.103 | -0.07 |
| 2.174999999999891 | -0.192 | -0.103 | -0.07 |
| 2.179999999999891 | -0.191 | -0.103 | -0.069 |
| 2.184999999999891 | -0.19 | -0.102 | -0.069 |
| 2.189999999999891 | -0.19 | -0.102 | -0.069 |
| 2.194999999999891 | -0.189 | -0.101 | -0.068 |
| 2.199999999999891 | -0.188 | -0.101 | -0.068 |
| 2.204999999999891 | -0.187 | -0.1 | -0.068 |
| 2.209999999999891 | -0.187 | -0.1 | -0.067 |
| 2.214999999999891 | -0.186 | -0.099 | -0.067 |
| 2.21999999999989 | -0.185 | -0.099 | -0.067 |
| 2.22499999999989 | -0.184 | -0.099 | -0.067 |
| 2.22999999999989 | -0.183 | -0.098 | -0.066 |
| 2.23499999999989 | -0.183 | -0.098 | -0.066 |
| 2.23999999999989 | -0.182 | -0.097 | -0.066 |
| 2.24499999999989 | -0.181 | -0.097 | -0.065 |
| 2.24999999999989 | -0.181 | -0.096 | -0.065 |
| 2.25499999999989 | -0.18 | -0.096 | -0.065 |
| 2.25999999999989 | -0.179 | -0.096 | -0.065 |
| 2.26499999999989 | -0.178 | -0.095 | -0.064 |
| 2.269999999999889 | -0.178 | -0.095 | -0.064 |
| 2.274999999999889 | -0.177 | -0.094 | -0.064 |
| 2.279999999999889 | -0.176 | -0.094 | -0.063 |
| 2.284999999999889 | -0.175 | -0.094 | -0.063 |
| 2.289999999999889 | -0.175 | -0.093 | -0.063 |
| 2.294999999999889 | -0.174 | -0.093 | -0.063 |
| 2.299999999999889 | -0.173 | -0.092 | -0.062 |
| 2.304999999999889 | -0.173 | -0.092 | -0.062 |
| 2.309999999999889 | -0.172 | -0.092 | -0.062 |
| 2.314999999999888 | -0.171 | -0.091 | -0.062 |
| 2.319999999999888 | -0.171 | -0.091 | -0.061 |
| 2.324999999999888 | -0.17 | -0.09 | -0.061 |
| 2.329999999999888 | -0.169 | -0.09 | -0.061 |
| 2.334999999999888 | -0.169 | -0.09 | -0.061 |
| 2.339999999999888 | -0.168 | -0.089 | -0.06 |
| 2.344999999999888 | -0.167 | -0.089 | -0.06 |
| 2.349999999999888 | -0.167 | -0.089 | -0.06 |
| 2.354999999999888 | -0.166 | -0.088 | -0.06 |
| 2.359999999999887 | -0.165 | -0.088 | -0.059 |
| 2.364999999999887 | -0.165 | -0.087 | -0.059 |
| 2.369999999999887 | -0.164 | -0.087 | -0.059 |
| 2.374999999999887 | -0.163 | -0.087 | -0.059 |
| 2.379999999999887 | -0.163 | -0.086 | -0.058 |
| 2.384999999999887 | -0.162 | -0.086 | -0.058 |
| 2.389999999999887 | -0.162 | -0.086 | -0.058 |
| 2.394999999999887 | -0.161 | -0.085 | -0.058 |
| 2.399999999999887 | -0.16 | -0.085 | -0.057 |
| 2.404999999999887 | -0.16 | -0.085 | -0.057 |
| 2.409999999999886 | -0.159 | -0.084 | -0.057 |
| 2.414999999999886 | -0.158 | -0.084 | -0.057 |
| 2.419999999999886 | -0.158 | -0.084 | -0.056 |
| 2.424999999999886 | -0.157 | -0.083 | -0.056 |
| 2.429999999999886 | -0.157 | -0.083 | -0.056 |
| 2.434999999999886 | -0.156 | -0.083 | -0.056 |
| 2.439999999999886 | -0.155 | -0.082 | -0.055 |
| 2.444999999999886 | -0.155 | -0.082 | -0.055 |
| 2.449999999999886 | -0.154 | -0.082 | -0.055 |
| 2.454999999999885 | -0.154 | -0.081 | -0.055 |
| 2.459999999999885 | -0.153 | -0.081 | -0.055 |
| 2.464999999999885 | -0.153 | -0.081 | -0.054 |
| 2.469999999999885 | -0.152 | -0.08 | -0.054 |
| 2.474999999999885 | -0.151 | -0.08 | -0.054 |
| 2.479999999999885 | -0.151 | -0.08 | -0.054 |
| 2.484999999999885 | -0.15 | -0.079 | -0.053 |
| 2.489999999999885 | -0.15 | -0.079 | -0.053 |
| 2.494999999999885 | -0.149 | -0.079 | -0.053 |
| 2.499999999999884 | -0.149 | -0.078 | -0.053 |
| 2.504999999999884 | -0.148 | -0.078 | -0.053 |
| 2.509999999999884 | -0.147 | -0.078 | -0.052 |
| 2.514999999999884 | -0.147 | -0.078 | -0.052 |
| 2.519999999999884 | -0.146 | -0.077 | -0.052 |
| 2.524999999999884 | -0.146 | -0.077 | -0.052 |
| 2.529999999999884 | -0.145 | -0.077 | -0.052 |
| 2.534999999999884 | -0.145 | -0.076 | -0.051 |
| 2.539999999999884 | -0.144 | -0.076 | -0.051 |
| 2.544999999999884 | -0.144 | -0.076 | -0.051 |
| 2.549999999999883 | -0.143 | -0.075 | -0.051 |
| 2.554999999999883 | -0.143 | -0.075 | -0.051 |
| 2.559999999999883 | -0.142 | -0.075 | -0.05 |
| 2.564999999999883 | -0.142 | -0.075 | -0.05 |
| 2.569999999999883 | -0.141 | -0.074 | -0.05 |
| 2.574999999999883 | -0.141 | -0.074 | -0.05 |
| 2.579999999999883 | -0.14 | -0.074 | -0.05 |
| 2.584999999999883 | -0.14 | -0.073 | -0.049 |
| 2.589999999999883 | -0.139 | -0.073 | -0.049 |
| 2.594999999999882 | -0.139 | -0.073 | -0.049 |
| 2.599999999999882 | -0.138 | -0.073 | -0.049 |
| 2.604999999999882 | -0.138 | -0.072 | -0.049 |
| 2.609999999999882 | -0.137 | -0.072 | -0.049 |
| 2.614999999999882 | -0.137 | -0.072 | -0.048 |
| 2.619999999999882 | -0.136 | -0.072 | -0.048 |
| 2.624999999999882 | -0.136 | -0.071 | -0.048 |
| 2.629999999999882 | -0.135 | -0.071 | -0.048 |
| 2.634999999999882 | -0.135 | -0.071 | -0.048 |
| 2.639999999999881 | -0.134 | -0.07 | -0.047 |
| 2.644999999999881 | -0.134 | -0.07 | -0.047 |
| 2.649999999999881 | -0.133 | -0.07 | -0.047 |
| 2.654999999999881 | -0.133 | -0.07 | -0.047 |
| 2.659999999999881 | -0.132 | -0.069 | -0.047 |
| 2.664999999999881 | -0.132 | -0.069 | -0.047 |
| 2.669999999999881 | -0.131 | -0.069 | -0.046 |
| 2.674999999999881 | -0.131 | -0.069 | -0.046 |
| 2.679999999999881 | -0.13 | -0.068 | -0.046 |
| 2.68499999999988 | -0.13 | -0.068 | -0.046 |
| 2.68999999999988 | -0.13 | -0.068 | -0.046 |
| 2.69499999999988 | -0.129 | -0.068 | -0.046 |
| 2.69999999999988 | -0.129 | -0.067 | -0.045 |
| 2.70499999999988 | -0.128 | -0.067 | -0.045 |
| 2.70999999999988 | -0.128 | -0.067 | -0.045 |
| 2.71499999999988 | -0.127 | -0.067 | -0.045 |
| 2.71999999999988 | -0.127 | -0.066 | -0.045 |
| 2.72499999999988 | -0.126 | -0.066 | -0.045 |
| 2.72999999999988 | -0.126 | -0.066 | -0.044 |
| 2.734999999999879 | -0.126 | -0.066 | -0.044 |
| 2.739999999999879 | -0.125 | -0.066 | -0.044 |
| 2.744999999999879 | -0.125 | -0.065 | -0.044 |
| 2.749999999999879 | -0.124 | -0.065 | -0.044 |
| 2.754999999999879 | -0.124 | -0.065 | -0.044 |
| 2.759999999999879 | -0.123 | -0.065 | -0.043 |
| 2.764999999999879 | -0.123 | -0.064 | -0.043 |
| 2.769999999999879 | -0.123 | -0.064 | -0.043 |
| 2.774999999999879 | -0.122 | -0.064 | -0.043 |
| 2.779999999999878 | -0.122 | -0.064 | -0.043 |
| 2.784999999999878 | -0.121 | -0.063 | -0.043 |
| 2.789999999999878 | -0.121 | -0.063 | -0.043 |
| 2.794999999999878 | -0.121 | -0.063 | -0.042 |
| 2.799999999999878 | -0.12 | -0.063 | -0.042 |
| 2.804999999999878 | -0.12 | -0.063 | -0.042 |
| 2.809999999999878 | -0.119 | -0.062 | -0.042 |
| 2.814999999999878 | -0.119 | -0.062 | -0.042 |
| 2.819999999999878 | -0.119 | -0.062 | -0.042 |
| 2.824999999999878 | -0.118 | -0.062 | -0.041 |
| 2.829999999999877 | -0.118 | -0.061 | -0.041 |
| 2.834999999999877 | -0.117 | -0.061 | -0.041 |
| 2.839999999999877 | -0.117 | -0.061 | -0.041 |
| 2.844999999999877 | -0.117 | -0.061 | -0.041 |
| 2.849999999999877 | -0.116 | -0.061 | -0.041 |
| 2.854999999999877 | -0.116 | -0.06 | -0.041 |
| 2.859999999999877 | -0.115 | -0.06 | -0.04 |
| 2.864999999999877 | -0.115 | -0.06 | -0.04 |
| 2.869999999999877 | -0.115 | -0.06 | -0.04 |
| 2.874999999999876 | -0.114 | -0.06 | -0.04 |
| 2.879999999999876 | -0.114 | -0.059 | -0.04 |
| 2.884999999999876 | -0.114 | -0.059 | -0.04 |
| 2.889999999999876 | -0.113 | -0.059 | -0.04 |
| 2.894999999999876 | -0.113 | -0.059 | -0.04 |
| 2.899999999999876 | -0.112 | -0.059 | -0.039 |
| 2.904999999999876 | -0.112 | -0.058 | -0.039 |
| 2.909999999999876 | -0.112 | -0.058 | -0.039 |
| 2.914999999999876 | -0.111 | -0.058 | -0.039 |
| 2.919999999999876 | -0.111 | -0.058 | -0.039 |
| 2.924999999999875 | -0.111 | -0.058 | -0.039 |
| 2.929999999999875 | -0.11 | -0.057 | -0.039 |
| 2.934999999999875 | -0.11 | -0.057 | -0.038 |
| 2.939999999999875 | -0.11 | -0.057 | -0.038 |
| 2.944999999999875 | -0.109 | -0.057 | -0.038 |
| 2.949999999999875 | -0.109 | -0.057 | -0.038 |
| 2.954999999999875 | -0.108 | -0.056 | -0.038 |
| 2.959999999999875 | -0.108 | -0.056 | -0.038 |
| 2.964999999999875 | -0.108 | -0.056 | -0.038 |
| 2.969999999999874 | -0.107 | -0.056 | -0.038 |
| 2.974999999999874 | -0.107 | -0.056 | -0.037 |
| 2.979999999999874 | -0.107 | -0.056 | -0.037 |
| 2.984999999999874 | -0.106 | -0.055 | -0.037 |
| 2.989999999999874 | -0.106 | -0.055 | -0.037 |
| 2.994999999999874 | -0.106 | -0.055 | -0.037 |
| 2.999999999999874 | -0.105 | -0.055 | -0.037 |
| 3.004999999999874 | -0.105 | -0.055 | -0.037 |
| 3.009999999999874 | -0.105 | -0.054 | -0.037 |
| 3.014999999999874 | -0.104 | -0.054 | -0.036 |
| 3.019999999999873 | -0.104 | -0.054 | -0.036 |
| 3.024999999999873 | -0.104 | -0.054 | -0.036 |
| 3.029999999999873 | -0.103 | -0.054 | -0.036 |
| 3.034999999999873 | -0.103 | -0.054 | -0.036 |
| 3.039999999999873 | -0.103 | -0.053 | -0.036 |
| 3.044999999999873 | -0.102 | -0.053 | -0.036 |
| 3.049999999999873 | -0.102 | -0.053 | -0.036 |
| 3.054999999999873 | -0.102 | -0.053 | -0.036 |
| 3.059999999999873 | -0.102 | -0.053 | -0.035 |
| 3.064999999999872 | -0.101 | -0.053 | -0.035 |
| 3.069999999999872 | -0.101 | -0.052 | -0.035 |
| 3.074999999999872 | -0.101 | -0.052 | -0.035 |
| 3.079999999999872 | -0.1 | -0.052 | -0.035 |
| 3.084999999999872 | -0.1 | -0.052 | -0.035 |
| 3.089999999999872 | -0.1 | -0.052 | -0.035 |
| 3.094999999999872 | -0.099 | -0.052 | -0.035 |
| 3.099999999999872 | -0.099 | -0.051 | -0.034 |
| 3.104999999999872 | -0.099 | -0.051 | -0.034 |
| 3.109999999999872 | -0.098 | -0.051 | -0.034 |
| 3.114999999999871 | -0.098 | -0.051 | -0.034 |
| 3.119999999999871 | -0.098 | -0.051 | -0.034 |
| 3.124999999999871 | -0.098 | -0.051 | -0.034 |
| 3.129999999999871 | -0.097 | -0.05 | -0.034 |
| 3.134999999999871 | -0.097 | -0.05 | -0.034 |
| 3.139999999999871 | -0.097 | -0.05 | -0.034 |
| 3.144999999999871 | -0.096 | -0.05 | -0.034 |
| 3.149999999999871 | -0.096 | -0.05 | -0.033 |
| 3.154999999999871 | -0.096 | -0.05 | -0.033 |
| 3.15999999999987 | -0.095 | -0.049 | -0.033 |
| 3.16499999999987 | -0.095 | -0.049 | -0.033 |
| 3.16999999999987 | -0.095 | -0.049 | -0.033 |
| 3.17499999999987 | -0.095 | -0.049 | -0.033 |
| 3.17999999999987 | -0.094 | -0.049 | -0.033 |
| 3.18499999999987 | -0.094 | -0.049 | -0.033 |
| 3.18999999999987 | -0.094 | -0.049 | -0.033 |
| 3.19499999999987 | -0.093 | -0.048 | -0.032 |
| 3.19999999999987 | -0.093 | -0.048 | -0.032 |
| 3.204999999999869 | -0.093 | -0.048 | -0.032 |
| 3.209999999999869 | -0.093 | -0.048 | -0.032 |
| 3.214999999999869 | -0.092 | -0.048 | -0.032 |
| 3.219999999999869 | -0.092 | -0.048 | -0.032 |
| 3.224999999999869 | -0.092 | -0.048 | -0.032 |
| 3.229999999999869 | -0.092 | -0.047 | -0.032 |
| 3.234999999999869 | -0.091 | -0.047 | -0.032 |
| 3.239999999999869 | -0.091 | -0.047 | -0.032 |
| 3.244999999999869 | -0.091 | -0.047 | -0.031 |
| 3.249999999999869 | -0.09 | -0.047 | -0.031 |
| 3.254999999999868 | -0.09 | -0.047 | -0.031 |
| 3.259999999999868 | -0.09 | -0.047 | -0.031 |
| 3.264999999999868 | -0.09 | -0.046 | -0.031 |
| 3.269999999999868 | -0.089 | -0.046 | -0.031 |
| 3.274999999999868 | -0.089 | -0.046 | -0.031 |
| 3.279999999999868 | -0.089 | -0.046 | -0.031 |
| 3.284999999999868 | -0.089 | -0.046 | -0.031 |
| 3.289999999999868 | -0.088 | -0.046 | -0.031 |
| 3.294999999999868 | -0.088 | -0.046 | -0.031 |
| 3.299999999999867 | -0.088 | -0.045 | -0.03 |
| 3.304999999999867 | -0.088 | -0.045 | -0.03 |
| 3.309999999999867 | -0.087 | -0.045 | -0.03 |
| 3.314999999999867 | -0.087 | -0.045 | -0.03 |
| 3.319999999999867 | -0.087 | -0.045 | -0.03 |
| 3.324999999999867 | -0.087 | -0.045 | -0.03 |
| 3.329999999999867 | -0.086 | -0.045 | -0.03 |
| 3.334999999999867 | -0.086 | -0.044 | -0.03 |
| 3.339999999999867 | -0.086 | -0.044 | -0.03 |
| 3.344999999999866 | -0.086 | -0.044 | -0.03 |
| 3.349999999999866 | -0.085 | -0.044 | -0.03 |
| 3.354999999999866 | -0.085 | -0.044 | -0.029 |
| 3.359999999999866 | -0.085 | -0.044 | -0.029 |
| 3.364999999999866 | -0.085 | -0.044 | -0.029 |
| 3.369999999999866 | -0.084 | -0.044 | -0.029 |
| 3.374999999999866 | -0.084 | -0.043 | -0.029 |
| 3.379999999999866 | -0.084 | -0.043 | -0.029 |
| 3.384999999999866 | -0.084 | -0.043 | -0.029 |
| 3.389999999999866 | -0.083 | -0.043 | -0.029 |
| 3.394999999999865 | -0.083 | -0.043 | -0.029 |
| 3.399999999999865 | -0.083 | -0.043 | -0.029 |
| 3.404999999999865 | -0.083 | -0.043 | -0.029 |
| 3.409999999999865 | -0.083 | -0.043 | -0.029 |
| 3.414999999999865 | -0.082 | -0.042 | -0.028 |
| 3.419999999999865 | -0.082 | -0.042 | -0.028 |
| 3.424999999999865 | -0.082 | -0.042 | -0.028 |
| 3.429999999999865 | -0.082 | -0.042 | -0.028 |
| 3.434999999999865 | -0.081 | -0.042 | -0.028 |
| 3.439999999999864 | -0.081 | -0.042 | -0.028 |
| 3.444999999999864 | -0.081 | -0.042 | -0.028 |
| 3.449999999999864 | -0.081 | -0.042 | -0.028 |
| 3.454999999999864 | -0.08 | -0.041 | -0.028 |
| 3.459999999999864 | -0.08 | -0.041 | -0.028 |
| 3.464999999999864 | -0.08 | -0.041 | -0.028 |
| 3.469999999999864 | -0.08 | -0.041 | -0.028 |
| 3.474999999999864 | -0.08 | -0.041 | -0.027 |
| 3.479999999999864 | -0.079 | -0.041 | -0.027 |
| 3.484999999999864 | -0.079 | -0.041 | -0.027 |
| 3.489999999999863 | -0.079 | -0.041 | -0.027 |
| 3.494999999999863 | -0.079 | -0.041 | -0.027 |
| 3.499999999999863 | -0.078 | -0.04 | -0.027 |
| 3.504999999999863 | -0.078 | -0.04 | -0.027 |
| 3.509999999999863 | -0.078 | -0.04 | -0.027 |
| 3.514999999999863 | -0.078 | -0.04 | -0.027 |
| 3.519999999999863 | -0.078 | -0.04 | -0.027 |
| 3.524999999999863 | -0.077 | -0.04 | -0.027 |
| 3.529999999999863 | -0.077 | -0.04 | -0.027 |
| 3.534999999999862 | -0.077 | -0.04 | -0.027 |
| 3.539999999999862 | -0.077 | -0.04 | -0.026 |
| 3.544999999999862 | -0.077 | -0.039 | -0.026 |
| 3.549999999999862 | -0.076 | -0.039 | -0.026 |
| 3.554999999999862 | -0.076 | -0.039 | -0.026 |
| 3.559999999999862 | -0.076 | -0.039 | -0.026 |
| 3.564999999999862 | -0.076 | -0.039 | -0.026 |
| 3.569999999999862 | -0.076 | -0.039 | -0.026 |
| 3.574999999999862 | -0.075 | -0.039 | -0.026 |
| 3.579999999999862 | -0.075 | -0.039 | -0.026 |
| 3.584999999999861 | -0.075 | -0.039 | -0.026 |
| 3.589999999999861 | -0.075 | -0.038 | -0.026 |
| 3.594999999999861 | -0.075 | -0.038 | -0.026 |
| 3.599999999999861 | -0.074 | -0.038 | -0.026 |
| 3.604999999999861 | -0.074 | -0.038 | -0.026 |
| 3.609999999999861 | -0.074 | -0.038 | -0.025 |
| 3.614999999999861 | -0.074 | -0.038 | -0.025 |
| 3.619999999999861 | -0.074 | -0.038 | -0.025 |
| 3.62499999999986 | -0.073 | -0.038 | -0.025 |
| 3.62999999999986 | -0.073 | -0.038 | -0.025 |
| 3.63499999999986 | -0.073 | -0.037 | -0.025 |
| 3.63999999999986 | -0.073 | -0.037 | -0.025 |
| 3.64499999999986 | -0.073 | -0.037 | -0.025 |
| 3.64999999999986 | -0.072 | -0.037 | -0.025 |
| 3.65499999999986 | -0.072 | -0.037 | -0.025 |
| 3.65999999999986 | -0.072 | -0.037 | -0.025 |
| 3.66499999999986 | -0.072 | -0.037 | -0.025 |
| 3.669999999999859 | -0.072 | -0.037 | -0.025 |
| 3.674999999999859 | -0.071 | -0.037 | -0.025 |
| 3.679999999999859 | -0.071 | -0.037 | -0.025 |
| 3.684999999999859 | -0.071 | -0.036 | -0.024 |
| 3.689999999999859 | -0.071 | -0.036 | -0.024 |
| 3.694999999999859 | -0.071 | -0.036 | -0.024 |
| 3.699999999999859 | -0.071 | -0.036 | -0.024 |
| 3.704999999999859 | -0.07 | -0.036 | -0.024 |
| 3.709999999999859 | -0.07 | -0.036 | -0.024 |
| 3.714999999999859 | -0.07 | -0.036 | -0.024 |
| 3.719999999999858 | -0.07 | -0.036 | -0.024 |
| 3.724999999999858 | -0.07 | -0.036 | -0.024 |
| 3.729999999999858 | -0.069 | -0.036 | -0.024 |
| 3.734999999999858 | -0.069 | -0.036 | -0.024 |
| 3.739999999999858 | -0.069 | -0.035 | -0.024 |
| 3.744999999999858 | -0.069 | -0.035 | -0.024 |
| 3.749999999999858 | -0.069 | -0.035 | -0.024 |
| 3.754999999999858 | -0.069 | -0.035 | -0.024 |
| 3.759999999999858 | -0.068 | -0.035 | -0.023 |
| 3.764999999999857 | -0.068 | -0.035 | -0.023 |
| 3.769999999999857 | -0.068 | -0.035 | -0.023 |
| 3.774999999999857 | -0.068 | -0.035 | -0.023 |
| 3.779999999999857 | -0.068 | -0.035 | -0.023 |
| 3.784999999999857 | -0.067 | -0.035 | -0.023 |
| 3.789999999999857 | -0.067 | -0.035 | -0.023 |
| 3.794999999999857 | -0.067 | -0.034 | -0.023 |
| 3.799999999999857 | -0.067 | -0.034 | -0.023 |
| 3.804999999999857 | -0.067 | -0.034 | -0.023 |
| 3.809999999999857 | -0.067 | -0.034 | -0.023 |
| 3.814999999999856 | -0.066 | -0.034 | -0.023 |
| 3.819999999999856 | -0.066 | -0.034 | -0.023 |
| 3.824999999999856 | -0.066 | -0.034 | -0.023 |
| 3.829999999999856 | -0.066 | -0.034 | -0.023 |
| 3.834999999999856 | -0.066 | -0.034 | -0.023 |
| 3.839999999999856 | -0.066 | -0.034 | -0.023 |
| 3.844999999999856 | -0.065 | -0.034 | -0.022 |
| 3.849999999999856 | -0.065 | -0.033 | -0.022 |
| 3.854999999999856 | -0.065 | -0.033 | -0.022 |
| 3.859999999999855 | -0.065 | -0.033 | -0.022 |
| 3.864999999999855 | -0.065 | -0.033 | -0.022 |
| 3.869999999999855 | -0.065 | -0.033 | -0.022 |
| 3.874999999999855 | -0.064 | -0.033 | -0.022 |
| 3.879999999999855 | -0.064 | -0.033 | -0.022 |
| 3.884999999999855 | -0.064 | -0.033 | -0.022 |
| 3.889999999999855 | -0.064 | -0.033 | -0.022 |
| 3.894999999999855 | -0.064 | -0.033 | -0.022 |
| 3.899999999999855 | -0.064 | -0.033 | -0.022 |
| 3.904999999999855 | -0.064 | -0.033 | -0.022 |
| 3.909999999999854 | -0.063 | -0.032 | -0.022 |
| 3.914999999999854 | -0.063 | -0.032 | -0.022 |
| 3.919999999999854 | -0.063 | -0.032 | -0.022 |
| 3.924999999999854 | -0.063 | -0.032 | -0.022 |
| 3.929999999999854 | -0.063 | -0.032 | -0.022 |
| 3.934999999999854 | -0.063 | -0.032 | -0.021 |
| 3.939999999999854 | -0.062 | -0.032 | -0.021 |
| 3.944999999999854 | -0.062 | -0.032 | -0.021 |
| 3.949999999999854 | -0.062 | -0.032 | -0.021 |
| 3.954999999999853 | -0.062 | -0.032 | -0.021 |
| 3.959999999999853 | -0.062 | -0.032 | -0.021 |
| 3.964999999999853 | -0.062 | -0.032 | -0.021 |
| 3.969999999999853 | -0.062 | -0.031 | -0.021 |
| 3.974999999999853 | -0.061 | -0.031 | -0.021 |
| 3.979999999999853 | -0.061 | -0.031 | -0.021 |
| 3.984999999999853 | -0.061 | -0.031 | -0.021 |
| 3.989999999999853 | -0.061 | -0.031 | -0.021 |
| 3.994999999999853 | -0.061 | -0.031 | -0.021 |
| 3.999999999999853 | -0.061 | -0.031 | -0.021 |
| 4.004999999999852 | -0.06 | -0.031 | -0.021 |
| 4.009999999999852 | -0.06 | -0.031 | -0.021 |
| 4.014999999999852 | -0.06 | -0.031 | -0.021 |
| 4.019999999999852 | -0.06 | -0.031 | -0.021 |
| 4.024999999999852 | -0.06 | -0.031 | -0.021 |
| 4.029999999999852 | -0.06 | -0.031 | -0.02 |
| 4.034999999999852 | -0.06 | -0.03 | -0.02 |
| 4.039999999999851 | -0.059 | -0.03 | -0.02 |
| 4.044999999999852 | -0.059 | -0.03 | -0.02 |
| 4.049999999999851 | -0.059 | -0.03 | -0.02 |
| 4.054999999999851 | -0.059 | -0.03 | -0.02 |
| 4.059999999999851 | -0.059 | -0.03 | -0.02 |
| 4.064999999999851 | -0.059 | -0.03 | -0.02 |
| 4.069999999999851 | -0.059 | -0.03 | -0.02 |
| 4.074999999999851 | -0.058 | -0.03 | -0.02 |
| 4.07999999999985 | -0.058 | -0.03 | -0.02 |
| 4.084999999999851 | -0.058 | -0.03 | -0.02 |
| 4.08999999999985 | -0.058 | -0.03 | -0.02 |
| 4.094999999999851 | -0.058 | -0.03 | -0.02 |
| 4.09999999999985 | -0.058 | -0.03 | -0.02 |
| 4.10499999999985 | -0.058 | -0.029 | -0.02 |
| 4.10999999999985 | -0.058 | -0.029 | -0.02 |
| 4.11499999999985 | -0.057 | -0.029 | -0.02 |
| 4.11999999999985 | -0.057 | -0.029 | -0.02 |
| 4.12499999999985 | -0.057 | -0.029 | -0.02 |
| 4.12999999999985 | -0.057 | -0.029 | -0.019 |
| 4.13499999999985 | -0.057 | -0.029 | -0.019 |
| 4.13999999999985 | -0.057 | -0.029 | -0.019 |
| 4.144999999999849 | -0.057 | -0.029 | -0.019 |
| 4.14999999999985 | -0.056 | -0.029 | -0.019 |
| 4.154999999999849 | -0.056 | -0.029 | -0.019 |
| 4.15999999999985 | -0.056 | -0.029 | -0.019 |
| 4.164999999999849 | -0.056 | -0.029 | -0.019 |
| 4.169999999999849 | -0.056 | -0.029 | -0.019 |
| 4.174999999999849 | -0.056 | -0.028 | -0.019 |
| 4.179999999999848 | -0.056 | -0.028 | -0.019 |
| 4.184999999999849 | -0.056 | -0.028 | -0.019 |
| 4.189999999999848 | -0.055 | -0.028 | -0.019 |
| 4.194999999999848 | -0.055 | -0.028 | -0.019 |
| 4.199999999999848 | -0.055 | -0.028 | -0.019 |
| 4.204999999999848 | -0.055 | -0.028 | -0.019 |
| 4.209999999999848 | -0.055 | -0.028 | -0.019 |
| 4.214999999999848 | -0.055 | -0.028 | -0.019 |
| 4.219999999999847 | -0.055 | -0.028 | -0.019 |
| 4.224999999999848 | -0.055 | -0.028 | -0.019 |
| 4.229999999999847 | -0.054 | -0.028 | -0.019 |
| 4.234999999999847 | -0.054 | -0.028 | -0.019 |
| 4.239999999999847 | -0.054 | -0.028 | -0.018 |
| 4.244999999999847 | -0.054 | -0.028 | -0.018 |
| 4.249999999999847 | -0.054 | -0.027 | -0.018 |
| 4.254999999999847 | -0.054 | -0.027 | -0.018 |
| 4.259999999999846 | -0.054 | -0.027 | -0.018 |
| 4.264999999999847 | -0.054 | -0.027 | -0.018 |
| 4.269999999999846 | -0.053 | -0.027 | -0.018 |
| 4.274999999999846 | -0.053 | -0.027 | -0.018 |
| 4.279999999999846 | -0.053 | -0.027 | -0.018 |
| 4.284999999999846 | -0.053 | -0.027 | -0.018 |
| 4.289999999999846 | -0.053 | -0.027 | -0.018 |
| 4.294999999999846 | -0.053 | -0.027 | -0.018 |
| 4.299999999999846 | -0.053 | -0.027 | -0.018 |
| 4.304999999999846 | -0.053 | -0.027 | -0.018 |
| 4.309999999999845 | -0.052 | -0.027 | -0.018 |
| 4.314999999999846 | -0.052 | -0.027 | -0.018 |
| 4.319999999999845 | -0.052 | -0.027 | -0.018 |
| 4.324999999999846 | -0.052 | -0.027 | -0.018 |
| 4.329999999999845 | -0.052 | -0.026 | -0.018 |
| 4.334999999999845 | -0.052 | -0.026 | -0.018 |
| 4.339999999999845 | -0.052 | -0.026 | -0.018 |
| 4.344999999999845 | -0.052 | -0.026 | -0.018 |
| 4.349999999999845 | -0.052 | -0.026 | -0.018 |
| 4.354999999999845 | -0.051 | -0.026 | -0.018 |
| 4.359999999999844 | -0.051 | -0.026 | -0.017 |
| 4.364999999999845 | -0.051 | -0.026 | -0.017 |
| 4.369999999999844 | -0.051 | -0.026 | -0.017 |
| 4.374999999999844 | -0.051 | -0.026 | -0.017 |
| 4.379999999999844 | -0.051 | -0.026 | -0.017 |
| 4.384999999999844 | -0.051 | -0.026 | -0.017 |
| 4.389999999999844 | -0.051 | -0.026 | -0.017 |
| 4.394999999999844 | -0.05 | -0.026 | -0.017 |
| 4.399999999999844 | -0.05 | -0.026 | -0.017 |
| 4.404999999999844 | -0.05 | -0.026 | -0.017 |
| 4.409999999999843 | -0.05 | -0.026 | -0.017 |
| 4.414999999999844 | -0.05 | -0.025 | -0.017 |
| 4.419999999999843 | -0.05 | -0.025 | -0.017 |
| 4.424999999999843 | -0.05 | -0.025 | -0.017 |
| 4.429999999999843 | -0.05 | -0.025 | -0.017 |
| 4.434999999999843 | -0.05 | -0.025 | -0.017 |
| 4.439999999999843 | -0.049 | -0.025 | -0.017 |
| 4.444999999999843 | -0.049 | -0.025 | -0.017 |
| 4.449999999999842 | -0.049 | -0.025 | -0.017 |
| 4.454999999999843 | -0.049 | -0.025 | -0.017 |
| 4.459999999999842 | -0.049 | -0.025 | -0.017 |
| 4.464999999999843 | -0.049 | -0.025 | -0.017 |
| 4.469999999999842 | -0.049 | -0.025 | -0.017 |
| 4.474999999999842 | -0.049 | -0.025 | -0.017 |
| 4.479999999999842 | -0.049 | -0.025 | -0.017 |
| 4.484999999999842 | -0.049 | -0.025 | -0.017 |
| 4.489999999999842 | -0.048 | -0.025 | -0.016 |
| 4.494999999999842 | -0.048 | -0.025 | -0.016 |
| 4.499999999999841 | -0.048 | -0.025 | -0.016 |
| 4.504999999999842 | -0.048 | -0.024 | -0.016 |
| 4.509999999999841 | -0.048 | -0.024 | -0.016 |
| 4.514999999999842 | -0.048 | -0.024 | -0.016 |
| 4.519999999999841 | -0.048 | -0.024 | -0.016 |
| 4.524999999999841 | -0.048 | -0.024 | -0.016 |
| 4.529999999999841 | -0.048 | -0.024 | -0.016 |
| 4.534999999999841 | -0.047 | -0.024 | -0.016 |
| 4.53999999999984 | -0.047 | -0.024 | -0.016 |
| 4.544999999999841 | -0.047 | -0.024 | -0.016 |
| 4.54999999999984 | -0.047 | -0.024 | -0.016 |
| 4.554999999999841 | -0.047 | -0.024 | -0.016 |
| 4.55999999999984 | -0.047 | -0.024 | -0.016 |
| 4.564999999999841 | -0.047 | -0.024 | -0.016 |
| 4.56999999999984 | -0.047 | -0.024 | -0.016 |
| 4.57499999999984 | -0.047 | -0.024 | -0.016 |
| 4.57999999999984 | -0.047 | -0.024 | -0.016 |
| 4.58499999999984 | -0.046 | -0.024 | -0.016 |
| 4.58999999999984 | -0.046 | -0.024 | -0.016 |
| 4.59499999999984 | -0.046 | -0.024 | -0.016 |
| 4.59999999999984 | -0.046 | -0.023 | -0.016 |
| 4.60499999999984 | -0.046 | -0.023 | -0.016 |
| 4.60999999999984 | -0.046 | -0.023 | -0.016 |
| 4.614999999999839 | -0.046 | -0.023 | -0.016 |
| 4.61999999999984 | -0.046 | -0.023 | -0.016 |
| 4.624999999999839 | -0.046 | -0.023 | -0.016 |
| 4.62999999999984 | -0.046 | -0.023 | -0.016 |
| 4.634999999999839 | -0.046 | -0.023 | -0.015 |
| 4.639999999999838 | -0.045 | -0.023 | -0.015 |
| 4.644999999999839 | -0.045 | -0.023 | -0.015 |
| 4.649999999999838 | -0.045 | -0.023 | -0.015 |
| 4.654999999999839 | -0.045 | -0.023 | -0.015 |
| 4.659999999999838 | -0.045 | -0.023 | -0.015 |
| 4.664999999999838 | -0.045 | -0.023 | -0.015 |
| 4.669999999999838 | -0.045 | -0.023 | -0.015 |
| 4.674999999999838 | -0.045 | -0.023 | -0.015 |
| 4.679999999999837 | -0.045 | -0.023 | -0.015 |
| 4.684999999999838 | -0.045 | -0.023 | -0.015 |
| 4.689999999999837 | -0.044 | -0.023 | -0.015 |
| 4.694999999999838 | -0.044 | -0.023 | -0.015 |
| 4.699999999999837 | -0.044 | -0.023 | -0.015 |
| 4.704999999999837 | -0.044 | -0.022 | -0.015 |
| 4.709999999999837 | -0.044 | -0.022 | -0.015 |
| 4.714999999999837 | -0.044 | -0.022 | -0.015 |
| 4.719999999999837 | -0.044 | -0.022 | -0.015 |
| 4.724999999999837 | -0.044 | -0.022 | -0.015 |
| 4.729999999999836 | -0.044 | -0.022 | -0.015 |
| 4.734999999999836 | -0.044 | -0.022 | -0.015 |
| 4.739999999999836 | -0.044 | -0.022 | -0.015 |
| 4.744999999999836 | -0.043 | -0.022 | -0.015 |
| 4.749999999999836 | -0.043 | -0.022 | -0.015 |
| 4.754999999999836 | -0.043 | -0.022 | -0.015 |
| 4.759999999999836 | -0.043 | -0.022 | -0.015 |
| 4.764999999999836 | -0.043 | -0.022 | -0.015 |
| 4.769999999999836 | -0.043 | -0.022 | -0.015 |
| 4.774999999999835 | -0.043 | -0.022 | -0.015 |
| 4.779999999999835 | -0.043 | -0.022 | -0.015 |
| 4.784999999999835 | -0.043 | -0.022 | -0.015 |
| 4.789999999999835 | -0.043 | -0.022 | -0.014 |
| 4.794999999999835 | -0.043 | -0.022 | -0.014 |
| 4.799999999999835 | -0.042 | -0.022 | -0.014 |
| 4.804999999999835 | -0.042 | -0.022 | -0.014 |
| 4.809999999999835 | -0.042 | -0.021 | -0.014 |
| 4.814999999999835 | -0.042 | -0.021 | -0.014 |
| 4.819999999999835 | -0.042 | -0.021 | -0.014 |
| 4.824999999999835 | -0.042 | -0.021 | -0.014 |
| 4.829999999999834 | -0.042 | -0.021 | -0.014 |
| 4.834999999999834 | -0.042 | -0.021 | -0.014 |
| 4.839999999999834 | -0.042 | -0.021 | -0.014 |
| 4.844999999999834 | -0.042 | -0.021 | -0.014 |
| 4.849999999999834 | -0.042 | -0.021 | -0.014 |
| 4.854999999999834 | -0.042 | -0.021 | -0.014 |
| 4.859999999999834 | -0.041 | -0.021 | -0.014 |
| 4.864999999999834 | -0.041 | -0.021 | -0.014 |
| 4.869999999999834 | -0.041 | -0.021 | -0.014 |
| 4.874999999999834 | -0.041 | -0.021 | -0.014 |
| 4.879999999999833 | -0.041 | -0.021 | -0.014 |
| 4.884999999999834 | -0.041 | -0.021 | -0.014 |
| 4.889999999999833 | -0.041 | -0.021 | -0.014 |
| 4.894999999999833 | -0.041 | -0.021 | -0.014 |
| 4.899999999999833 | -0.041 | -0.021 | -0.014 |
| 4.904999999999833 | -0.041 | -0.021 | -0.014 |
| 4.909999999999833 | -0.041 | -0.021 | -0.014 |
| 4.914999999999833 | -0.041 | -0.021 | -0.014 |
| 4.919999999999832 | -0.04 | -0.021 | -0.014 |
| 4.924999999999833 | -0.04 | -0.021 | -0.014 |
| 4.929999999999832 | -0.04 | -0.02 | -0.014 |
| 4.934999999999832 | -0.04 | -0.02 | -0.014 |
| 4.939999999999832 | -0.04 | -0.02 | -0.014 |
| 4.944999999999832 | -0.04 | -0.02 | -0.014 |
| 4.949999999999832 | -0.04 | -0.02 | -0.014 |
| 4.954999999999832 | -0.04 | -0.02 | -0.014 |
| 4.959999999999832 | -0.04 | -0.02 | -0.014 |
| 4.964999999999832 | -0.04 | -0.02 | -0.013 |
| 4.969999999999831 | -0.04 | -0.02 | -0.013 |
| 4.974999999999831 | -0.04 | -0.02 | -0.013 |
| 4.97999999999983 | -0.04 | -0.02 | -0.013 |
| 4.984999999999831 | -0.039 | -0.02 | -0.013 |
| 4.98999999999983 | -0.039 | -0.02 | -0.013 |
| 4.994999999999831 | -0.039 | -0.02 | -0.013 |
| 4.99999999999983 | -0.039 | -0.02 | -0.013 |